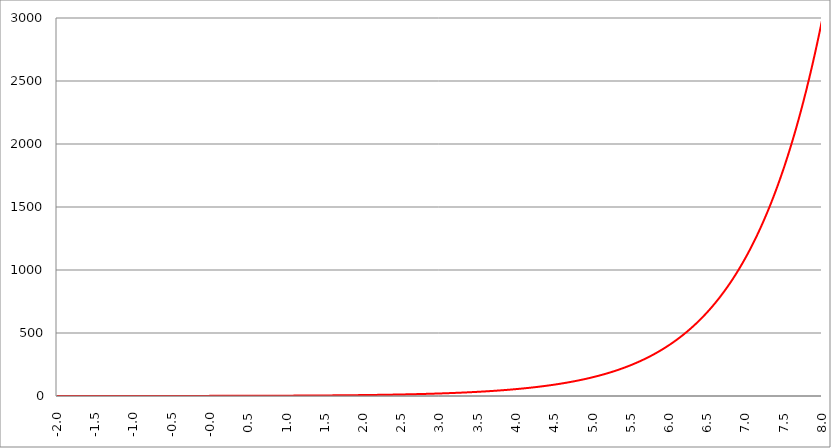
| Category | Series 1 | Series 0 | Series 2 |
|---|---|---|---|
| -2.0 | 0.135 |  |  |
| -1.995 | 0.136 |  |  |
| -1.99 | 0.137 |  |  |
| -1.985 | 0.137 |  |  |
| -1.98 | 0.138 |  |  |
| -1.975000000000001 | 0.139 |  |  |
| -1.970000000000001 | 0.139 |  |  |
| -1.965000000000001 | 0.14 |  |  |
| -1.960000000000001 | 0.141 |  |  |
| -1.955000000000001 | 0.142 |  |  |
| -1.950000000000001 | 0.142 |  |  |
| -1.945000000000001 | 0.143 |  |  |
| -1.940000000000001 | 0.144 |  |  |
| -1.935000000000001 | 0.144 |  |  |
| -1.930000000000001 | 0.145 |  |  |
| -1.925000000000002 | 0.146 |  |  |
| -1.920000000000002 | 0.147 |  |  |
| -1.915000000000002 | 0.147 |  |  |
| -1.910000000000002 | 0.148 |  |  |
| -1.905000000000002 | 0.149 |  |  |
| -1.900000000000002 | 0.15 |  |  |
| -1.895000000000002 | 0.15 |  |  |
| -1.890000000000002 | 0.151 |  |  |
| -1.885000000000002 | 0.152 |  |  |
| -1.880000000000002 | 0.153 |  |  |
| -1.875000000000003 | 0.153 |  |  |
| -1.870000000000003 | 0.154 |  |  |
| -1.865000000000003 | 0.155 |  |  |
| -1.860000000000003 | 0.156 |  |  |
| -1.855000000000003 | 0.156 |  |  |
| -1.850000000000003 | 0.157 |  |  |
| -1.845000000000003 | 0.158 |  |  |
| -1.840000000000003 | 0.159 |  |  |
| -1.835000000000003 | 0.16 |  |  |
| -1.830000000000004 | 0.16 |  |  |
| -1.825000000000004 | 0.161 |  |  |
| -1.820000000000004 | 0.162 |  |  |
| -1.815000000000004 | 0.163 |  |  |
| -1.810000000000004 | 0.164 |  |  |
| -1.805000000000004 | 0.164 |  |  |
| -1.800000000000004 | 0.165 |  |  |
| -1.795000000000004 | 0.166 |  |  |
| -1.790000000000004 | 0.167 |  |  |
| -1.785000000000004 | 0.168 |  |  |
| -1.780000000000005 | 0.169 |  |  |
| -1.775000000000005 | 0.169 |  |  |
| -1.770000000000005 | 0.17 |  |  |
| -1.765000000000005 | 0.171 |  |  |
| -1.760000000000005 | 0.172 |  |  |
| -1.755000000000005 | 0.173 |  |  |
| -1.750000000000005 | 0.174 |  |  |
| -1.745000000000005 | 0.175 |  |  |
| -1.740000000000005 | 0.176 |  |  |
| -1.735000000000006 | 0.176 |  |  |
| -1.730000000000006 | 0.177 |  |  |
| -1.725000000000006 | 0.178 |  |  |
| -1.720000000000006 | 0.179 |  |  |
| -1.715000000000006 | 0.18 |  |  |
| -1.710000000000006 | 0.181 |  |  |
| -1.705000000000006 | 0.182 |  |  |
| -1.700000000000006 | 0.183 |  |  |
| -1.695000000000006 | 0.184 |  |  |
| -1.690000000000006 | 0.185 |  |  |
| -1.685000000000007 | 0.185 |  |  |
| -1.680000000000007 | 0.186 |  |  |
| -1.675000000000007 | 0.187 |  |  |
| -1.670000000000007 | 0.188 |  |  |
| -1.665000000000007 | 0.189 |  |  |
| -1.660000000000007 | 0.19 |  |  |
| -1.655000000000007 | 0.191 |  |  |
| -1.650000000000007 | 0.192 |  |  |
| -1.645000000000007 | 0.193 |  |  |
| -1.640000000000008 | 0.194 |  |  |
| -1.635000000000008 | 0.195 |  |  |
| -1.630000000000008 | 0.196 |  |  |
| -1.625000000000008 | 0.197 |  |  |
| -1.620000000000008 | 0.198 |  |  |
| -1.615000000000008 | 0.199 |  |  |
| -1.610000000000008 | 0.2 |  |  |
| -1.605000000000008 | 0.201 |  |  |
| -1.600000000000008 | 0.202 |  |  |
| -1.595000000000009 | 0.203 |  |  |
| -1.590000000000009 | 0.204 |  |  |
| -1.585000000000009 | 0.205 |  |  |
| -1.580000000000009 | 0.206 |  |  |
| -1.57500000000001 | 0.207 |  |  |
| -1.57000000000001 | 0.208 |  |  |
| -1.565000000000009 | 0.209 |  |  |
| -1.560000000000009 | 0.21 |  |  |
| -1.555000000000009 | 0.211 |  |  |
| -1.55000000000001 | 0.212 |  |  |
| -1.54500000000001 | 0.213 |  |  |
| -1.54000000000001 | 0.214 |  |  |
| -1.53500000000001 | 0.215 |  |  |
| -1.53000000000001 | 0.217 |  |  |
| -1.52500000000001 | 0.218 |  |  |
| -1.52000000000001 | 0.219 |  |  |
| -1.51500000000001 | 0.22 |  |  |
| -1.51000000000001 | 0.221 |  |  |
| -1.505000000000011 | 0.222 |  |  |
| -1.500000000000011 | 0.223 |  |  |
| -1.495000000000011 | 0.224 |  |  |
| -1.490000000000011 | 0.225 |  |  |
| -1.485000000000011 | 0.227 |  |  |
| -1.480000000000011 | 0.228 |  |  |
| -1.475000000000011 | 0.229 |  |  |
| -1.470000000000011 | 0.23 |  |  |
| -1.465000000000011 | 0.231 |  |  |
| -1.460000000000011 | 0.232 |  |  |
| -1.455000000000012 | 0.233 |  |  |
| -1.450000000000012 | 0.235 |  |  |
| -1.445000000000012 | 0.236 |  |  |
| -1.440000000000012 | 0.237 |  |  |
| -1.435000000000012 | 0.238 |  |  |
| -1.430000000000012 | 0.239 |  |  |
| -1.425000000000012 | 0.241 |  |  |
| -1.420000000000012 | 0.242 |  |  |
| -1.415000000000012 | 0.243 |  |  |
| -1.410000000000013 | 0.244 |  |  |
| -1.405000000000013 | 0.245 |  |  |
| -1.400000000000013 | 0.247 |  |  |
| -1.395000000000013 | 0.248 |  |  |
| -1.390000000000013 | 0.249 |  |  |
| -1.385000000000013 | 0.25 |  |  |
| -1.380000000000013 | 0.252 |  |  |
| -1.375000000000013 | 0.253 |  |  |
| -1.370000000000013 | 0.254 |  |  |
| -1.365000000000013 | 0.255 |  |  |
| -1.360000000000014 | 0.257 |  |  |
| -1.355000000000014 | 0.258 |  |  |
| -1.350000000000014 | 0.259 |  |  |
| -1.345000000000014 | 0.261 |  |  |
| -1.340000000000014 | 0.262 |  |  |
| -1.335000000000014 | 0.263 |  |  |
| -1.330000000000014 | 0.264 |  |  |
| -1.325000000000014 | 0.266 |  |  |
| -1.320000000000014 | 0.267 |  |  |
| -1.315000000000015 | 0.268 |  |  |
| -1.310000000000015 | 0.27 |  |  |
| -1.305000000000015 | 0.271 |  |  |
| -1.300000000000015 | 0.273 |  |  |
| -1.295000000000015 | 0.274 |  |  |
| -1.290000000000015 | 0.275 |  |  |
| -1.285000000000015 | 0.277 |  |  |
| -1.280000000000015 | 0.278 |  |  |
| -1.275000000000015 | 0.279 |  |  |
| -1.270000000000016 | 0.281 |  |  |
| -1.265000000000016 | 0.282 |  |  |
| -1.260000000000016 | 0.284 |  |  |
| -1.255000000000016 | 0.285 |  |  |
| -1.250000000000016 | 0.287 |  |  |
| -1.245000000000016 | 0.288 |  |  |
| -1.240000000000016 | 0.289 |  |  |
| -1.235000000000016 | 0.291 |  |  |
| -1.230000000000016 | 0.292 |  |  |
| -1.225000000000017 | 0.294 |  |  |
| -1.220000000000017 | 0.295 |  |  |
| -1.215000000000017 | 0.297 |  |  |
| -1.210000000000017 | 0.298 |  |  |
| -1.205000000000017 | 0.3 |  |  |
| -1.200000000000017 | 0.301 |  |  |
| -1.195000000000017 | 0.303 |  |  |
| -1.190000000000017 | 0.304 |  |  |
| -1.185000000000017 | 0.306 |  |  |
| -1.180000000000017 | 0.307 |  |  |
| -1.175000000000018 | 0.309 |  |  |
| -1.170000000000018 | 0.31 |  |  |
| -1.165000000000018 | 0.312 |  |  |
| -1.160000000000018 | 0.313 |  |  |
| -1.155000000000018 | 0.315 |  |  |
| -1.150000000000018 | 0.317 |  |  |
| -1.145000000000018 | 0.318 |  |  |
| -1.140000000000018 | 0.32 |  |  |
| -1.135000000000018 | 0.321 |  |  |
| -1.130000000000019 | 0.323 |  |  |
| -1.125000000000019 | 0.325 |  |  |
| -1.120000000000019 | 0.326 |  |  |
| -1.115000000000019 | 0.328 |  |  |
| -1.110000000000019 | 0.33 |  |  |
| -1.10500000000002 | 0.331 |  |  |
| -1.10000000000002 | 0.333 |  |  |
| -1.095000000000019 | 0.335 |  |  |
| -1.090000000000019 | 0.336 |  |  |
| -1.085000000000019 | 0.338 |  |  |
| -1.08000000000002 | 0.34 |  |  |
| -1.07500000000002 | 0.341 |  |  |
| -1.07000000000002 | 0.343 |  |  |
| -1.06500000000002 | 0.345 |  |  |
| -1.06000000000002 | 0.346 |  |  |
| -1.05500000000002 | 0.348 |  |  |
| -1.05000000000002 | 0.35 |  |  |
| -1.04500000000002 | 0.352 |  |  |
| -1.04000000000002 | 0.353 |  |  |
| -1.035000000000021 | 0.355 |  |  |
| -1.030000000000021 | 0.357 |  |  |
| -1.025000000000021 | 0.359 |  |  |
| -1.020000000000021 | 0.361 |  |  |
| -1.015000000000021 | 0.362 |  |  |
| -1.010000000000021 | 0.364 |  |  |
| -1.005000000000021 | 0.366 |  |  |
| -1.000000000000021 | 0.368 |  |  |
| -0.995000000000021 | 0.37 |  |  |
| -0.990000000000021 | 0.372 |  |  |
| -0.985000000000021 | 0.373 |  |  |
| -0.980000000000021 | 0.375 |  |  |
| -0.975000000000021 | 0.377 |  |  |
| -0.970000000000021 | 0.379 |  |  |
| -0.965000000000021 | 0.381 |  |  |
| -0.960000000000021 | 0.383 |  |  |
| -0.955000000000021 | 0.385 |  |  |
| -0.950000000000021 | 0.387 |  |  |
| -0.945000000000021 | 0.389 |  |  |
| -0.940000000000021 | 0.391 |  |  |
| -0.935000000000021 | 0.393 |  |  |
| -0.930000000000021 | 0.395 |  |  |
| -0.925000000000021 | 0.397 |  |  |
| -0.920000000000021 | 0.399 |  |  |
| -0.915000000000021 | 0.401 |  |  |
| -0.910000000000021 | 0.403 |  |  |
| -0.905000000000021 | 0.405 |  |  |
| -0.900000000000021 | 0.407 |  |  |
| -0.895000000000021 | 0.409 |  |  |
| -0.890000000000021 | 0.411 |  |  |
| -0.885000000000021 | 0.413 |  |  |
| -0.880000000000021 | 0.415 |  |  |
| -0.875000000000021 | 0.417 |  |  |
| -0.870000000000021 | 0.419 |  |  |
| -0.865000000000021 | 0.421 |  |  |
| -0.860000000000021 | 0.423 |  |  |
| -0.855000000000021 | 0.425 |  |  |
| -0.850000000000021 | 0.427 |  |  |
| -0.845000000000021 | 0.43 |  |  |
| -0.840000000000021 | 0.432 |  |  |
| -0.835000000000021 | 0.434 |  |  |
| -0.830000000000021 | 0.436 |  |  |
| -0.825000000000021 | 0.438 |  |  |
| -0.820000000000021 | 0.44 |  |  |
| -0.815000000000021 | 0.443 |  |  |
| -0.810000000000021 | 0.445 |  |  |
| -0.805000000000021 | 0.447 |  |  |
| -0.800000000000021 | 0.449 |  |  |
| -0.795000000000021 | 0.452 |  |  |
| -0.790000000000021 | 0.454 |  |  |
| -0.785000000000021 | 0.456 |  |  |
| -0.780000000000021 | 0.458 |  |  |
| -0.775000000000021 | 0.461 |  |  |
| -0.770000000000021 | 0.463 |  |  |
| -0.765000000000021 | 0.465 |  |  |
| -0.760000000000021 | 0.468 |  |  |
| -0.755000000000021 | 0.47 |  |  |
| -0.750000000000021 | 0.472 |  |  |
| -0.745000000000021 | 0.475 |  |  |
| -0.740000000000021 | 0.477 |  |  |
| -0.735000000000021 | 0.48 |  |  |
| -0.730000000000021 | 0.482 |  |  |
| -0.725000000000021 | 0.484 |  |  |
| -0.720000000000021 | 0.487 |  |  |
| -0.715000000000021 | 0.489 |  |  |
| -0.710000000000021 | 0.492 |  |  |
| -0.705000000000021 | 0.494 |  |  |
| -0.700000000000021 | 0.497 |  |  |
| -0.695000000000021 | 0.499 |  |  |
| -0.690000000000021 | 0.502 |  |  |
| -0.685000000000021 | 0.504 |  |  |
| -0.680000000000021 | 0.507 |  |  |
| -0.675000000000021 | 0.509 |  |  |
| -0.670000000000021 | 0.512 |  |  |
| -0.665000000000021 | 0.514 |  |  |
| -0.660000000000021 | 0.517 |  |  |
| -0.655000000000021 | 0.519 |  |  |
| -0.650000000000021 | 0.522 |  |  |
| -0.645000000000021 | 0.525 |  |  |
| -0.640000000000021 | 0.527 |  |  |
| -0.635000000000021 | 0.53 |  |  |
| -0.630000000000021 | 0.533 |  |  |
| -0.625000000000021 | 0.535 |  |  |
| -0.620000000000021 | 0.538 |  |  |
| -0.615000000000021 | 0.541 |  |  |
| -0.610000000000021 | 0.543 |  |  |
| -0.605000000000021 | 0.546 |  |  |
| -0.600000000000021 | 0.549 |  |  |
| -0.595000000000021 | 0.552 |  |  |
| -0.590000000000021 | 0.554 |  |  |
| -0.585000000000021 | 0.557 |  |  |
| -0.580000000000021 | 0.56 |  |  |
| -0.575000000000021 | 0.563 |  |  |
| -0.570000000000021 | 0.566 |  |  |
| -0.565000000000021 | 0.568 |  |  |
| -0.560000000000021 | 0.571 |  |  |
| -0.555000000000021 | 0.574 |  |  |
| -0.550000000000021 | 0.577 |  |  |
| -0.545000000000021 | 0.58 |  |  |
| -0.540000000000021 | 0.583 |  |  |
| -0.535000000000021 | 0.586 |  |  |
| -0.530000000000021 | 0.589 |  |  |
| -0.525000000000021 | 0.592 |  |  |
| -0.520000000000021 | 0.595 |  |  |
| -0.515000000000021 | 0.598 |  |  |
| -0.510000000000021 | 0.6 |  |  |
| -0.505000000000021 | 0.604 |  |  |
| -0.500000000000021 | 0.607 |  |  |
| -0.495000000000021 | 0.61 |  |  |
| -0.490000000000021 | 0.613 |  |  |
| -0.485000000000021 | 0.616 |  |  |
| -0.480000000000021 | 0.619 |  |  |
| -0.475000000000021 | 0.622 |  |  |
| -0.470000000000021 | 0.625 |  |  |
| -0.465000000000021 | 0.628 |  |  |
| -0.460000000000021 | 0.631 |  |  |
| -0.455000000000021 | 0.634 |  |  |
| -0.450000000000021 | 0.638 |  |  |
| -0.445000000000021 | 0.641 |  |  |
| -0.440000000000021 | 0.644 |  |  |
| -0.435000000000021 | 0.647 |  |  |
| -0.430000000000021 | 0.651 |  |  |
| -0.425000000000021 | 0.654 |  |  |
| -0.420000000000021 | 0.657 |  |  |
| -0.415000000000021 | 0.66 |  |  |
| -0.410000000000021 | 0.664 |  |  |
| -0.405000000000021 | 0.667 |  |  |
| -0.400000000000021 | 0.67 |  |  |
| -0.395000000000021 | 0.674 |  |  |
| -0.390000000000021 | 0.677 |  |  |
| -0.385000000000021 | 0.68 |  |  |
| -0.380000000000021 | 0.684 |  |  |
| -0.375000000000021 | 0.687 |  |  |
| -0.370000000000021 | 0.691 |  |  |
| -0.365000000000021 | 0.694 |  |  |
| -0.360000000000021 | 0.698 |  |  |
| -0.355000000000021 | 0.701 |  |  |
| -0.350000000000021 | 0.705 |  |  |
| -0.345000000000021 | 0.708 |  |  |
| -0.340000000000021 | 0.712 |  |  |
| -0.335000000000021 | 0.715 |  |  |
| -0.330000000000021 | 0.719 |  |  |
| -0.325000000000021 | 0.723 |  |  |
| -0.320000000000021 | 0.726 |  |  |
| -0.315000000000021 | 0.73 |  |  |
| -0.310000000000021 | 0.733 |  |  |
| -0.305000000000021 | 0.737 |  |  |
| -0.300000000000021 | 0.741 |  |  |
| -0.295000000000021 | 0.745 |  |  |
| -0.290000000000021 | 0.748 |  |  |
| -0.285000000000021 | 0.752 |  |  |
| -0.280000000000021 | 0.756 |  |  |
| -0.275000000000021 | 0.76 |  |  |
| -0.270000000000021 | 0.763 |  |  |
| -0.265000000000021 | 0.767 |  |  |
| -0.260000000000021 | 0.771 |  |  |
| -0.255000000000021 | 0.775 |  |  |
| -0.250000000000021 | 0.779 |  |  |
| -0.245000000000021 | 0.783 |  |  |
| -0.240000000000021 | 0.787 |  |  |
| -0.235000000000021 | 0.791 |  |  |
| -0.230000000000021 | 0.795 |  |  |
| -0.225000000000021 | 0.799 |  |  |
| -0.220000000000021 | 0.803 |  |  |
| -0.215000000000021 | 0.807 |  |  |
| -0.210000000000021 | 0.811 |  |  |
| -0.205000000000021 | 0.815 |  |  |
| -0.200000000000021 | 0.819 |  |  |
| -0.195000000000021 | 0.823 |  |  |
| -0.190000000000021 | 0.827 |  |  |
| -0.185000000000021 | 0.831 |  |  |
| -0.180000000000021 | 0.835 |  |  |
| -0.175000000000021 | 0.839 |  |  |
| -0.170000000000021 | 0.844 |  |  |
| -0.165000000000021 | 0.848 |  |  |
| -0.160000000000021 | 0.852 |  |  |
| -0.155000000000021 | 0.856 |  |  |
| -0.150000000000021 | 0.861 |  |  |
| -0.145000000000021 | 0.865 |  |  |
| -0.140000000000021 | 0.869 |  |  |
| -0.135000000000021 | 0.874 |  |  |
| -0.130000000000021 | 0.878 |  |  |
| -0.125000000000021 | 0.882 |  |  |
| -0.120000000000021 | 0.887 |  |  |
| -0.115000000000021 | 0.891 |  |  |
| -0.110000000000021 | 0.896 |  |  |
| -0.105000000000021 | 0.9 |  |  |
| -0.100000000000021 | 0.905 |  |  |
| -0.0950000000000205 | 0.909 |  |  |
| -0.0900000000000205 | 0.914 |  |  |
| -0.0850000000000205 | 0.919 |  |  |
| -0.0800000000000205 | 0.923 |  |  |
| -0.0750000000000205 | 0.928 |  |  |
| -0.0700000000000205 | 0.932 |  |  |
| -0.0650000000000205 | 0.937 |  |  |
| -0.0600000000000205 | 0.942 |  |  |
| -0.0550000000000205 | 0.946 |  |  |
| -0.0500000000000205 | 0.951 |  |  |
| -0.0450000000000205 | 0.956 |  |  |
| -0.0400000000000205 | 0.961 |  |  |
| -0.0350000000000205 | 0.966 |  |  |
| -0.0300000000000205 | 0.97 |  |  |
| -0.0250000000000205 | 0.975 |  |  |
| -0.0200000000000205 | 0.98 |  |  |
| -0.0150000000000205 | 0.985 |  |  |
| -0.0100000000000205 | 0.99 |  |  |
| -0.00500000000002049 | 0.995 |  |  |
| -2.0495757868666e-14 | 1 |  |  |
| 0.0049999999999795 | 1.005 |  |  |
| 0.0099999999999795 | 1.01 |  |  |
| 0.0149999999999795 | 1.015 |  |  |
| 0.0199999999999795 | 1.02 |  |  |
| 0.0249999999999795 | 1.025 |  |  |
| 0.0299999999999795 | 1.03 |  |  |
| 0.0349999999999795 | 1.036 |  |  |
| 0.0399999999999795 | 1.041 |  |  |
| 0.0449999999999795 | 1.046 |  |  |
| 0.0499999999999795 | 1.051 |  |  |
| 0.0549999999999795 | 1.057 |  |  |
| 0.0599999999999795 | 1.062 |  |  |
| 0.0649999999999795 | 1.067 |  |  |
| 0.0699999999999795 | 1.073 |  |  |
| 0.0749999999999795 | 1.078 |  |  |
| 0.0799999999999795 | 1.083 |  |  |
| 0.0849999999999795 | 1.089 |  |  |
| 0.0899999999999795 | 1.094 |  |  |
| 0.0949999999999795 | 1.1 |  |  |
| 0.0999999999999795 | 1.105 |  |  |
| 0.10499999999998 | 1.111 |  |  |
| 0.10999999999998 | 1.116 |  |  |
| 0.11499999999998 | 1.122 |  |  |
| 0.11999999999998 | 1.127 |  |  |
| 0.12499999999998 | 1.133 |  |  |
| 0.12999999999998 | 1.139 |  |  |
| 0.13499999999998 | 1.145 |  |  |
| 0.13999999999998 | 1.15 |  |  |
| 0.14499999999998 | 1.156 |  |  |
| 0.14999999999998 | 1.162 |  |  |
| 0.15499999999998 | 1.168 |  |  |
| 0.15999999999998 | 1.174 |  |  |
| 0.16499999999998 | 1.179 |  |  |
| 0.16999999999998 | 1.185 |  |  |
| 0.17499999999998 | 1.191 |  |  |
| 0.17999999999998 | 1.197 |  |  |
| 0.18499999999998 | 1.203 |  |  |
| 0.18999999999998 | 1.209 |  |  |
| 0.19499999999998 | 1.215 |  |  |
| 0.19999999999998 | 1.221 |  |  |
| 0.20499999999998 | 1.228 |  |  |
| 0.20999999999998 | 1.234 |  |  |
| 0.21499999999998 | 1.24 |  |  |
| 0.21999999999998 | 1.246 |  |  |
| 0.22499999999998 | 1.252 |  |  |
| 0.22999999999998 | 1.259 |  |  |
| 0.23499999999998 | 1.265 |  |  |
| 0.23999999999998 | 1.271 |  |  |
| 0.24499999999998 | 1.278 |  |  |
| 0.24999999999998 | 1.284 |  |  |
| 0.25499999999998 | 1.29 |  |  |
| 0.25999999999998 | 1.297 |  |  |
| 0.26499999999998 | 1.303 |  |  |
| 0.26999999999998 | 1.31 |  |  |
| 0.27499999999998 | 1.317 |  |  |
| 0.27999999999998 | 1.323 |  |  |
| 0.28499999999998 | 1.33 |  |  |
| 0.28999999999998 | 1.336 |  |  |
| 0.29499999999998 | 1.343 |  |  |
| 0.29999999999998 | 1.35 |  |  |
| 0.30499999999998 | 1.357 |  |  |
| 0.30999999999998 | 1.363 |  |  |
| 0.31499999999998 | 1.37 |  |  |
| 0.31999999999998 | 1.377 |  |  |
| 0.32499999999998 | 1.384 |  |  |
| 0.32999999999998 | 1.391 |  |  |
| 0.33499999999998 | 1.398 |  |  |
| 0.33999999999998 | 1.405 |  |  |
| 0.34499999999998 | 1.412 |  |  |
| 0.34999999999998 | 1.419 |  |  |
| 0.35499999999998 | 1.426 |  |  |
| 0.35999999999998 | 1.433 |  |  |
| 0.36499999999998 | 1.441 |  |  |
| 0.36999999999998 | 1.448 |  |  |
| 0.37499999999998 | 1.455 |  |  |
| 0.37999999999998 | 1.462 |  |  |
| 0.38499999999998 | 1.47 |  |  |
| 0.38999999999998 | 1.477 |  |  |
| 0.39499999999998 | 1.484 |  |  |
| 0.39999999999998 | 1.492 |  |  |
| 0.40499999999998 | 1.499 |  |  |
| 0.40999999999998 | 1.507 |  |  |
| 0.41499999999998 | 1.514 |  |  |
| 0.41999999999998 | 1.522 |  |  |
| 0.42499999999998 | 1.53 |  |  |
| 0.42999999999998 | 1.537 |  |  |
| 0.43499999999998 | 1.545 |  |  |
| 0.43999999999998 | 1.553 |  |  |
| 0.44499999999998 | 1.56 |  |  |
| 0.44999999999998 | 1.568 |  |  |
| 0.45499999999998 | 1.576 |  |  |
| 0.45999999999998 | 1.584 |  |  |
| 0.46499999999998 | 1.592 |  |  |
| 0.46999999999998 | 1.6 |  |  |
| 0.47499999999998 | 1.608 |  |  |
| 0.47999999999998 | 1.616 |  |  |
| 0.48499999999998 | 1.624 |  |  |
| 0.48999999999998 | 1.632 |  |  |
| 0.49499999999998 | 1.64 |  |  |
| 0.49999999999998 | 1.649 |  |  |
| 0.50499999999998 | 1.657 |  |  |
| 0.50999999999998 | 1.665 |  |  |
| 0.51499999999998 | 1.674 |  |  |
| 0.51999999999998 | 1.682 |  |  |
| 0.52499999999998 | 1.69 |  |  |
| 0.52999999999998 | 1.699 |  |  |
| 0.53499999999998 | 1.707 |  |  |
| 0.53999999999998 | 1.716 |  |  |
| 0.54499999999998 | 1.725 |  |  |
| 0.54999999999998 | 1.733 |  |  |
| 0.55499999999998 | 1.742 |  |  |
| 0.55999999999998 | 1.751 |  |  |
| 0.56499999999998 | 1.759 |  |  |
| 0.56999999999998 | 1.768 |  |  |
| 0.57499999999998 | 1.777 |  |  |
| 0.57999999999998 | 1.786 |  |  |
| 0.58499999999998 | 1.795 |  |  |
| 0.58999999999998 | 1.804 |  |  |
| 0.59499999999998 | 1.813 |  |  |
| 0.59999999999998 | 1.822 |  |  |
| 0.60499999999998 | 1.831 |  |  |
| 0.60999999999998 | 1.84 |  |  |
| 0.61499999999998 | 1.85 |  |  |
| 0.61999999999998 | 1.859 |  |  |
| 0.62499999999998 | 1.868 |  |  |
| 0.62999999999998 | 1.878 |  |  |
| 0.63499999999998 | 1.887 |  |  |
| 0.63999999999998 | 1.896 |  |  |
| 0.64499999999998 | 1.906 |  |  |
| 0.64999999999998 | 1.916 |  |  |
| 0.65499999999998 | 1.925 |  |  |
| 0.65999999999998 | 1.935 |  |  |
| 0.66499999999998 | 1.944 |  |  |
| 0.66999999999998 | 1.954 |  |  |
| 0.67499999999998 | 1.964 |  |  |
| 0.67999999999998 | 1.974 |  |  |
| 0.68499999999998 | 1.984 |  |  |
| 0.68999999999998 | 1.994 |  |  |
| 0.69499999999998 | 2.004 |  |  |
| 0.69999999999998 | 2.014 |  |  |
| 0.70499999999998 | 2.024 |  |  |
| 0.70999999999998 | 2.034 |  |  |
| 0.71499999999998 | 2.044 |  |  |
| 0.71999999999998 | 2.054 |  |  |
| 0.72499999999998 | 2.065 |  |  |
| 0.72999999999998 | 2.075 |  |  |
| 0.73499999999998 | 2.085 |  |  |
| 0.73999999999998 | 2.096 |  |  |
| 0.74499999999998 | 2.106 |  |  |
| 0.74999999999998 | 2.117 |  |  |
| 0.75499999999998 | 2.128 |  |  |
| 0.75999999999998 | 2.138 |  |  |
| 0.76499999999998 | 2.149 |  |  |
| 0.76999999999998 | 2.16 |  |  |
| 0.77499999999998 | 2.171 |  |  |
| 0.77999999999998 | 2.181 |  |  |
| 0.78499999999998 | 2.192 |  |  |
| 0.78999999999998 | 2.203 |  |  |
| 0.79499999999998 | 2.214 |  |  |
| 0.79999999999998 | 2.226 |  |  |
| 0.80499999999998 | 2.237 |  |  |
| 0.80999999999998 | 2.248 |  |  |
| 0.81499999999998 | 2.259 |  |  |
| 0.81999999999998 | 2.27 |  |  |
| 0.82499999999998 | 2.282 |  |  |
| 0.82999999999998 | 2.293 |  |  |
| 0.83499999999998 | 2.305 |  |  |
| 0.83999999999998 | 2.316 |  |  |
| 0.84499999999998 | 2.328 |  |  |
| 0.84999999999998 | 2.34 |  |  |
| 0.85499999999998 | 2.351 |  |  |
| 0.85999999999998 | 2.363 |  |  |
| 0.86499999999998 | 2.375 |  |  |
| 0.86999999999998 | 2.387 |  |  |
| 0.87499999999998 | 2.399 |  |  |
| 0.87999999999998 | 2.411 |  |  |
| 0.88499999999998 | 2.423 |  |  |
| 0.88999999999998 | 2.435 |  |  |
| 0.89499999999998 | 2.447 |  |  |
| 0.89999999999998 | 2.46 |  |  |
| 0.90499999999998 | 2.472 |  |  |
| 0.90999999999998 | 2.484 |  |  |
| 0.91499999999998 | 2.497 |  |  |
| 0.91999999999998 | 2.509 |  |  |
| 0.92499999999998 | 2.522 |  |  |
| 0.92999999999998 | 2.535 |  |  |
| 0.93499999999998 | 2.547 |  |  |
| 0.93999999999998 | 2.56 |  |  |
| 0.94499999999998 | 2.573 |  |  |
| 0.94999999999998 | 2.586 |  |  |
| 0.95499999999998 | 2.599 |  |  |
| 0.95999999999998 | 2.612 |  |  |
| 0.96499999999998 | 2.625 |  |  |
| 0.96999999999998 | 2.638 |  |  |
| 0.97499999999998 | 2.651 |  |  |
| 0.97999999999998 | 2.664 |  |  |
| 0.98499999999998 | 2.678 |  |  |
| 0.98999999999998 | 2.691 |  |  |
| 0.99499999999998 | 2.705 |  |  |
| 0.99999999999998 | 2.718 |  |  |
| 1.00499999999998 | 2.732 |  |  |
| 1.00999999999998 | 2.746 |  |  |
| 1.01499999999998 | 2.759 |  |  |
| 1.01999999999998 | 2.773 |  |  |
| 1.02499999999998 | 2.787 |  |  |
| 1.02999999999998 | 2.801 |  |  |
| 1.034999999999979 | 2.815 |  |  |
| 1.039999999999979 | 2.829 |  |  |
| 1.044999999999979 | 2.843 |  |  |
| 1.049999999999979 | 2.858 |  |  |
| 1.054999999999979 | 2.872 |  |  |
| 1.059999999999979 | 2.886 |  |  |
| 1.064999999999979 | 2.901 |  |  |
| 1.069999999999979 | 2.915 |  |  |
| 1.074999999999979 | 2.93 |  |  |
| 1.079999999999979 | 2.945 |  |  |
| 1.084999999999978 | 2.959 |  |  |
| 1.089999999999978 | 2.974 |  |  |
| 1.094999999999978 | 2.989 |  |  |
| 1.099999999999978 | 3.004 |  |  |
| 1.104999999999978 | 3.019 |  |  |
| 1.109999999999978 | 3.034 |  |  |
| 1.114999999999978 | 3.05 |  |  |
| 1.119999999999978 | 3.065 |  |  |
| 1.124999999999978 | 3.08 |  |  |
| 1.129999999999977 | 3.096 |  |  |
| 1.134999999999977 | 3.111 |  |  |
| 1.139999999999977 | 3.127 |  |  |
| 1.144999999999977 | 3.142 |  |  |
| 1.149999999999977 | 3.158 |  |  |
| 1.154999999999977 | 3.174 |  |  |
| 1.159999999999977 | 3.19 |  |  |
| 1.164999999999977 | 3.206 |  |  |
| 1.169999999999977 | 3.222 |  |  |
| 1.174999999999976 | 3.238 |  |  |
| 1.179999999999976 | 3.254 |  |  |
| 1.184999999999976 | 3.271 |  |  |
| 1.189999999999976 | 3.287 |  |  |
| 1.194999999999976 | 3.304 |  |  |
| 1.199999999999976 | 3.32 |  |  |
| 1.204999999999976 | 3.337 |  |  |
| 1.209999999999976 | 3.353 |  |  |
| 1.214999999999976 | 3.37 |  |  |
| 1.219999999999976 | 3.387 |  |  |
| 1.224999999999975 | 3.404 |  |  |
| 1.229999999999975 | 3.421 |  |  |
| 1.234999999999975 | 3.438 |  |  |
| 1.239999999999975 | 3.456 |  |  |
| 1.244999999999975 | 3.473 |  |  |
| 1.249999999999975 | 3.49 |  |  |
| 1.254999999999975 | 3.508 |  |  |
| 1.259999999999975 | 3.525 |  |  |
| 1.264999999999975 | 3.543 |  |  |
| 1.269999999999974 | 3.561 |  |  |
| 1.274999999999974 | 3.579 |  |  |
| 1.279999999999974 | 3.597 |  |  |
| 1.284999999999974 | 3.615 |  |  |
| 1.289999999999974 | 3.633 |  |  |
| 1.294999999999974 | 3.651 |  |  |
| 1.299999999999974 | 3.669 |  |  |
| 1.304999999999974 | 3.688 |  |  |
| 1.309999999999974 | 3.706 |  |  |
| 1.314999999999973 | 3.725 |  |  |
| 1.319999999999973 | 3.743 |  |  |
| 1.324999999999973 | 3.762 |  |  |
| 1.329999999999973 | 3.781 |  |  |
| 1.334999999999973 | 3.8 |  |  |
| 1.339999999999973 | 3.819 |  |  |
| 1.344999999999973 | 3.838 |  |  |
| 1.349999999999973 | 3.857 |  |  |
| 1.354999999999973 | 3.877 |  |  |
| 1.359999999999973 | 3.896 |  |  |
| 1.364999999999972 | 3.916 |  |  |
| 1.369999999999972 | 3.935 |  |  |
| 1.374999999999972 | 3.955 |  |  |
| 1.379999999999972 | 3.975 |  |  |
| 1.384999999999972 | 3.995 |  |  |
| 1.389999999999972 | 4.015 |  |  |
| 1.394999999999972 | 4.035 |  |  |
| 1.399999999999972 | 4.055 |  |  |
| 1.404999999999972 | 4.076 |  |  |
| 1.409999999999971 | 4.096 |  |  |
| 1.414999999999971 | 4.116 |  |  |
| 1.419999999999971 | 4.137 |  |  |
| 1.424999999999971 | 4.158 |  |  |
| 1.429999999999971 | 4.179 |  |  |
| 1.434999999999971 | 4.2 |  |  |
| 1.439999999999971 | 4.221 |  |  |
| 1.444999999999971 | 4.242 |  |  |
| 1.449999999999971 | 4.263 |  |  |
| 1.454999999999971 | 4.284 |  |  |
| 1.45999999999997 | 4.306 |  |  |
| 1.46499999999997 | 4.328 |  |  |
| 1.46999999999997 | 4.349 |  |  |
| 1.47499999999997 | 4.371 |  |  |
| 1.47999999999997 | 4.393 |  |  |
| 1.48499999999997 | 4.415 |  |  |
| 1.48999999999997 | 4.437 |  |  |
| 1.49499999999997 | 4.459 |  |  |
| 1.49999999999997 | 4.482 |  |  |
| 1.504999999999969 | 4.504 |  |  |
| 1.509999999999969 | 4.527 |  |  |
| 1.514999999999969 | 4.549 |  |  |
| 1.519999999999969 | 4.572 |  |  |
| 1.524999999999969 | 4.595 |  |  |
| 1.529999999999969 | 4.618 |  |  |
| 1.534999999999969 | 4.641 |  |  |
| 1.539999999999969 | 4.665 |  |  |
| 1.544999999999969 | 4.688 |  |  |
| 1.549999999999969 | 4.711 |  |  |
| 1.554999999999968 | 4.735 |  |  |
| 1.559999999999968 | 4.759 |  |  |
| 1.564999999999968 | 4.783 |  |  |
| 1.569999999999968 | 4.807 |  |  |
| 1.574999999999968 | 4.831 |  |  |
| 1.579999999999968 | 4.855 |  |  |
| 1.584999999999968 | 4.879 |  |  |
| 1.589999999999968 | 4.904 |  |  |
| 1.594999999999968 | 4.928 |  |  |
| 1.599999999999967 | 4.953 |  |  |
| 1.604999999999967 | 4.978 |  |  |
| 1.609999999999967 | 5.003 |  |  |
| 1.614999999999967 | 5.028 |  |  |
| 1.619999999999967 | 5.053 |  |  |
| 1.624999999999967 | 5.078 |  |  |
| 1.629999999999967 | 5.104 |  |  |
| 1.634999999999967 | 5.129 |  |  |
| 1.639999999999966 | 5.155 |  |  |
| 1.644999999999966 | 5.181 |  |  |
| 1.649999999999966 | 5.207 |  |  |
| 1.654999999999966 | 5.233 |  |  |
| 1.659999999999966 | 5.259 |  |  |
| 1.664999999999966 | 5.286 |  |  |
| 1.669999999999966 | 5.312 |  |  |
| 1.674999999999966 | 5.339 |  |  |
| 1.679999999999966 | 5.366 |  |  |
| 1.684999999999966 | 5.392 |  |  |
| 1.689999999999965 | 5.419 |  |  |
| 1.694999999999965 | 5.447 |  |  |
| 1.699999999999965 | 5.474 |  |  |
| 1.704999999999965 | 5.501 |  |  |
| 1.709999999999965 | 5.529 |  |  |
| 1.714999999999965 | 5.557 |  |  |
| 1.719999999999965 | 5.585 |  |  |
| 1.724999999999965 | 5.613 |  |  |
| 1.729999999999965 | 5.641 |  |  |
| 1.734999999999964 | 5.669 |  |  |
| 1.739999999999964 | 5.697 |  |  |
| 1.744999999999964 | 5.726 |  |  |
| 1.749999999999964 | 5.755 |  |  |
| 1.754999999999964 | 5.783 |  |  |
| 1.759999999999964 | 5.812 |  |  |
| 1.764999999999964 | 5.842 |  |  |
| 1.769999999999964 | 5.871 |  |  |
| 1.774999999999964 | 5.9 |  |  |
| 1.779999999999964 | 5.93 |  |  |
| 1.784999999999963 | 5.96 |  |  |
| 1.789999999999963 | 5.989 |  |  |
| 1.794999999999963 | 6.019 |  |  |
| 1.799999999999963 | 6.05 |  |  |
| 1.804999999999963 | 6.08 |  |  |
| 1.809999999999963 | 6.11 |  |  |
| 1.814999999999963 | 6.141 |  |  |
| 1.819999999999963 | 6.172 |  |  |
| 1.824999999999963 | 6.203 |  |  |
| 1.829999999999962 | 6.234 |  |  |
| 1.834999999999962 | 6.265 |  |  |
| 1.839999999999962 | 6.297 |  |  |
| 1.844999999999962 | 6.328 |  |  |
| 1.849999999999962 | 6.36 |  |  |
| 1.854999999999962 | 6.392 |  |  |
| 1.859999999999962 | 6.424 |  |  |
| 1.864999999999962 | 6.456 |  |  |
| 1.869999999999962 | 6.488 |  |  |
| 1.874999999999962 | 6.521 |  |  |
| 1.879999999999961 | 6.554 |  |  |
| 1.884999999999961 | 6.586 |  |  |
| 1.889999999999961 | 6.619 |  |  |
| 1.894999999999961 | 6.653 |  |  |
| 1.899999999999961 | 6.686 |  |  |
| 1.904999999999961 | 6.719 |  |  |
| 1.909999999999961 | 6.753 |  |  |
| 1.914999999999961 | 6.787 |  |  |
| 1.919999999999961 | 6.821 |  |  |
| 1.92499999999996 | 6.855 |  |  |
| 1.92999999999996 | 6.89 |  |  |
| 1.93499999999996 | 6.924 |  |  |
| 1.93999999999996 | 6.959 |  |  |
| 1.94499999999996 | 6.994 |  |  |
| 1.94999999999996 | 7.029 |  |  |
| 1.95499999999996 | 7.064 |  |  |
| 1.95999999999996 | 7.099 |  |  |
| 1.96499999999996 | 7.135 |  |  |
| 1.96999999999996 | 7.171 |  |  |
| 1.974999999999959 | 7.207 |  |  |
| 1.979999999999959 | 7.243 |  |  |
| 1.984999999999959 | 7.279 |  |  |
| 1.989999999999959 | 7.316 |  |  |
| 1.994999999999959 | 7.352 |  |  |
| 1.999999999999959 | 7.389 |  |  |
| 2.00499999999996 | 7.426 |  |  |
| 2.009999999999959 | 7.463 |  |  |
| 2.014999999999959 | 7.501 |  |  |
| 2.019999999999959 | 7.538 |  |  |
| 2.024999999999959 | 7.576 |  |  |
| 2.029999999999958 | 7.614 |  |  |
| 2.034999999999958 | 7.652 |  |  |
| 2.039999999999958 | 7.691 |  |  |
| 2.044999999999958 | 7.729 |  |  |
| 2.049999999999958 | 7.768 |  |  |
| 2.054999999999958 | 7.807 |  |  |
| 2.059999999999958 | 7.846 |  |  |
| 2.064999999999958 | 7.885 |  |  |
| 2.069999999999958 | 7.925 |  |  |
| 2.074999999999958 | 7.965 |  |  |
| 2.079999999999957 | 8.004 |  |  |
| 2.084999999999957 | 8.045 |  |  |
| 2.089999999999957 | 8.085 |  |  |
| 2.094999999999957 | 8.125 |  |  |
| 2.099999999999957 | 8.166 |  |  |
| 2.104999999999957 | 8.207 |  |  |
| 2.109999999999957 | 8.248 |  |  |
| 2.114999999999957 | 8.29 |  |  |
| 2.119999999999957 | 8.331 |  |  |
| 2.124999999999956 | 8.373 |  |  |
| 2.129999999999956 | 8.415 |  |  |
| 2.134999999999956 | 8.457 |  |  |
| 2.139999999999956 | 8.499 |  |  |
| 2.144999999999956 | 8.542 |  |  |
| 2.149999999999956 | 8.585 |  |  |
| 2.154999999999956 | 8.628 |  |  |
| 2.159999999999956 | 8.671 |  |  |
| 2.164999999999956 | 8.715 |  |  |
| 2.169999999999955 | 8.758 |  |  |
| 2.174999999999955 | 8.802 |  |  |
| 2.179999999999955 | 8.846 |  |  |
| 2.184999999999955 | 8.891 |  |  |
| 2.189999999999955 | 8.935 |  |  |
| 2.194999999999955 | 8.98 |  |  |
| 2.199999999999955 | 9.025 |  |  |
| 2.204999999999955 | 9.07 |  |  |
| 2.209999999999955 | 9.116 |  |  |
| 2.214999999999955 | 9.161 |  |  |
| 2.219999999999954 | 9.207 |  |  |
| 2.224999999999954 | 9.253 |  |  |
| 2.229999999999954 | 9.3 |  |  |
| 2.234999999999954 | 9.346 |  |  |
| 2.239999999999954 | 9.393 |  |  |
| 2.244999999999954 | 9.44 |  |  |
| 2.249999999999954 | 9.488 |  |  |
| 2.254999999999954 | 9.535 |  |  |
| 2.259999999999954 | 9.583 |  |  |
| 2.264999999999953 | 9.631 |  |  |
| 2.269999999999953 | 9.679 |  |  |
| 2.274999999999953 | 9.728 |  |  |
| 2.279999999999953 | 9.777 |  |  |
| 2.284999999999953 | 9.826 |  |  |
| 2.289999999999953 | 9.875 |  |  |
| 2.294999999999953 | 9.924 |  |  |
| 2.299999999999953 | 9.974 |  |  |
| 2.304999999999953 | 10.024 |  |  |
| 2.309999999999952 | 10.074 |  |  |
| 2.314999999999952 | 10.125 |  |  |
| 2.319999999999952 | 10.176 |  |  |
| 2.324999999999952 | 10.227 |  |  |
| 2.329999999999952 | 10.278 |  |  |
| 2.334999999999952 | 10.329 |  |  |
| 2.339999999999952 | 10.381 |  |  |
| 2.344999999999952 | 10.433 |  |  |
| 2.349999999999952 | 10.486 |  |  |
| 2.354999999999952 | 10.538 |  |  |
| 2.359999999999951 | 10.591 |  |  |
| 2.364999999999951 | 10.644 |  |  |
| 2.369999999999951 | 10.697 |  |  |
| 2.374999999999951 | 10.751 |  |  |
| 2.379999999999951 | 10.805 |  |  |
| 2.384999999999951 | 10.859 |  |  |
| 2.389999999999951 | 10.913 |  |  |
| 2.394999999999951 | 10.968 |  |  |
| 2.399999999999951 | 11.023 |  |  |
| 2.40499999999995 | 11.078 |  |  |
| 2.40999999999995 | 11.134 |  |  |
| 2.41499999999995 | 11.19 |  |  |
| 2.41999999999995 | 11.246 |  |  |
| 2.42499999999995 | 11.302 |  |  |
| 2.42999999999995 | 11.359 |  |  |
| 2.43499999999995 | 11.416 |  |  |
| 2.43999999999995 | 11.473 |  |  |
| 2.44499999999995 | 11.531 |  |  |
| 2.44999999999995 | 11.588 |  |  |
| 2.454999999999949 | 11.646 |  |  |
| 2.459999999999949 | 11.705 |  |  |
| 2.464999999999949 | 11.763 |  |  |
| 2.469999999999949 | 11.822 |  |  |
| 2.474999999999949 | 11.882 |  |  |
| 2.479999999999949 | 11.941 |  |  |
| 2.484999999999949 | 12.001 |  |  |
| 2.489999999999949 | 12.061 |  |  |
| 2.494999999999949 | 12.122 |  |  |
| 2.499999999999948 | 12.182 |  |  |
| 2.504999999999948 | 12.244 |  |  |
| 2.509999999999948 | 12.305 |  |  |
| 2.514999999999948 | 12.367 |  |  |
| 2.519999999999948 | 12.429 |  |  |
| 2.524999999999948 | 12.491 |  |  |
| 2.529999999999948 | 12.554 |  |  |
| 2.534999999999948 | 12.616 |  |  |
| 2.539999999999948 | 12.68 |  |  |
| 2.544999999999948 | 12.743 |  |  |
| 2.549999999999947 | 12.807 |  |  |
| 2.554999999999947 | 12.871 |  |  |
| 2.559999999999947 | 12.936 |  |  |
| 2.564999999999947 | 13.001 |  |  |
| 2.569999999999947 | 13.066 |  |  |
| 2.574999999999947 | 13.131 |  |  |
| 2.579999999999947 | 13.197 |  |  |
| 2.584999999999947 | 13.263 |  |  |
| 2.589999999999947 | 13.33 |  |  |
| 2.594999999999946 | 13.397 |  |  |
| 2.599999999999946 | 13.464 |  |  |
| 2.604999999999946 | 13.531 |  |  |
| 2.609999999999946 | 13.599 |  |  |
| 2.614999999999946 | 13.667 |  |  |
| 2.619999999999946 | 13.736 |  |  |
| 2.624999999999946 | 13.805 |  |  |
| 2.629999999999946 | 13.874 |  |  |
| 2.634999999999946 | 13.943 |  |  |
| 2.639999999999945 | 14.013 |  |  |
| 2.644999999999945 | 14.083 |  |  |
| 2.649999999999945 | 14.154 |  |  |
| 2.654999999999945 | 14.225 |  |  |
| 2.659999999999945 | 14.296 |  |  |
| 2.664999999999945 | 14.368 |  |  |
| 2.669999999999945 | 14.44 |  |  |
| 2.674999999999945 | 14.512 |  |  |
| 2.679999999999945 | 14.585 |  |  |
| 2.684999999999944 | 14.658 |  |  |
| 2.689999999999944 | 14.732 |  |  |
| 2.694999999999944 | 14.806 |  |  |
| 2.699999999999944 | 14.88 |  |  |
| 2.704999999999944 | 14.954 |  |  |
| 2.709999999999944 | 15.029 |  |  |
| 2.714999999999944 | 15.105 |  |  |
| 2.719999999999944 | 15.18 |  |  |
| 2.724999999999944 | 15.256 |  |  |
| 2.729999999999944 | 15.333 |  |  |
| 2.734999999999943 | 15.41 |  |  |
| 2.739999999999943 | 15.487 |  |  |
| 2.744999999999943 | 15.565 |  |  |
| 2.749999999999943 | 15.643 |  |  |
| 2.754999999999943 | 15.721 |  |  |
| 2.759999999999943 | 15.8 |  |  |
| 2.764999999999943 | 15.879 |  |  |
| 2.769999999999943 | 15.959 |  |  |
| 2.774999999999943 | 16.039 |  |  |
| 2.779999999999942 | 16.119 |  |  |
| 2.784999999999942 | 16.2 |  |  |
| 2.789999999999942 | 16.281 |  |  |
| 2.794999999999942 | 16.363 |  |  |
| 2.799999999999942 | 16.445 |  |  |
| 2.804999999999942 | 16.527 |  |  |
| 2.809999999999942 | 16.61 |  |  |
| 2.814999999999942 | 16.693 |  |  |
| 2.819999999999942 | 16.777 |  |  |
| 2.824999999999942 | 16.861 |  |  |
| 2.829999999999941 | 16.945 |  |  |
| 2.834999999999941 | 17.03 |  |  |
| 2.839999999999941 | 17.116 |  |  |
| 2.844999999999941 | 17.202 |  |  |
| 2.849999999999941 | 17.288 |  |  |
| 2.854999999999941 | 17.374 |  |  |
| 2.859999999999941 | 17.462 |  |  |
| 2.864999999999941 | 17.549 |  |  |
| 2.869999999999941 | 17.637 |  |  |
| 2.87499999999994 | 17.725 |  |  |
| 2.87999999999994 | 17.814 |  |  |
| 2.88499999999994 | 17.904 |  |  |
| 2.88999999999994 | 17.993 |  |  |
| 2.89499999999994 | 18.084 |  |  |
| 2.89999999999994 | 18.174 |  |  |
| 2.90499999999994 | 18.265 |  |  |
| 2.90999999999994 | 18.357 |  |  |
| 2.91499999999994 | 18.449 |  |  |
| 2.91999999999994 | 18.541 |  |  |
| 2.924999999999939 | 18.634 |  |  |
| 2.929999999999939 | 18.728 |  |  |
| 2.934999999999939 | 18.822 |  |  |
| 2.939999999999939 | 18.916 |  |  |
| 2.944999999999939 | 19.011 |  |  |
| 2.949999999999939 | 19.106 |  |  |
| 2.954999999999939 | 19.202 |  |  |
| 2.959999999999939 | 19.298 |  |  |
| 2.964999999999939 | 19.395 |  |  |
| 2.969999999999938 | 19.492 |  |  |
| 2.974999999999938 | 19.59 |  |  |
| 2.979999999999938 | 19.688 |  |  |
| 2.984999999999938 | 19.787 |  |  |
| 2.989999999999938 | 19.886 |  |  |
| 2.994999999999938 | 19.985 |  |  |
| 2.999999999999938 | 20.086 |  |  |
| 3.004999999999938 | 20.186 |  |  |
| 3.009999999999938 | 20.287 |  |  |
| 3.014999999999938 | 20.389 |  |  |
| 3.019999999999937 | 20.491 |  |  |
| 3.024999999999937 | 20.594 |  |  |
| 3.029999999999937 | 20.697 |  |  |
| 3.034999999999937 | 20.801 |  |  |
| 3.039999999999937 | 20.905 |  |  |
| 3.044999999999937 | 21.01 |  |  |
| 3.049999999999937 | 21.115 |  |  |
| 3.054999999999937 | 21.221 |  |  |
| 3.059999999999937 | 21.328 |  |  |
| 3.064999999999936 | 21.434 |  |  |
| 3.069999999999936 | 21.542 |  |  |
| 3.074999999999936 | 21.65 |  |  |
| 3.079999999999936 | 21.758 |  |  |
| 3.084999999999936 | 21.867 |  |  |
| 3.089999999999936 | 21.977 |  |  |
| 3.094999999999936 | 22.087 |  |  |
| 3.099999999999936 | 22.198 |  |  |
| 3.104999999999936 | 22.309 |  |  |
| 3.109999999999935 | 22.421 |  |  |
| 3.114999999999935 | 22.533 |  |  |
| 3.119999999999935 | 22.646 |  |  |
| 3.124999999999935 | 22.76 |  |  |
| 3.129999999999935 | 22.874 |  |  |
| 3.134999999999935 | 22.989 |  |  |
| 3.139999999999935 | 23.104 |  |  |
| 3.144999999999935 | 23.22 |  |  |
| 3.149999999999935 | 23.336 |  |  |
| 3.154999999999935 | 23.453 |  |  |
| 3.159999999999934 | 23.571 |  |  |
| 3.164999999999934 | 23.689 |  |  |
| 3.169999999999934 | 23.807 |  |  |
| 3.174999999999934 | 23.927 |  |  |
| 3.179999999999934 | 24.047 |  |  |
| 3.184999999999934 | 24.167 |  |  |
| 3.189999999999934 | 24.288 |  |  |
| 3.194999999999934 | 24.41 |  |  |
| 3.199999999999934 | 24.533 |  |  |
| 3.204999999999933 | 24.656 |  |  |
| 3.209999999999933 | 24.779 |  |  |
| 3.214999999999933 | 24.903 |  |  |
| 3.219999999999933 | 25.028 |  |  |
| 3.224999999999933 | 25.154 |  |  |
| 3.229999999999933 | 25.28 |  |  |
| 3.234999999999933 | 25.406 |  |  |
| 3.239999999999933 | 25.534 |  |  |
| 3.244999999999932 | 25.662 |  |  |
| 3.249999999999932 | 25.79 |  |  |
| 3.254999999999932 | 25.92 |  |  |
| 3.259999999999932 | 26.05 |  |  |
| 3.264999999999932 | 26.18 |  |  |
| 3.269999999999932 | 26.311 |  |  |
| 3.274999999999932 | 26.443 |  |  |
| 3.279999999999932 | 26.576 |  |  |
| 3.284999999999932 | 26.709 |  |  |
| 3.289999999999932 | 26.843 |  |  |
| 3.294999999999932 | 26.977 |  |  |
| 3.299999999999931 | 27.113 |  |  |
| 3.304999999999931 | 27.249 |  |  |
| 3.309999999999931 | 27.385 |  |  |
| 3.314999999999931 | 27.522 |  |  |
| 3.319999999999931 | 27.66 |  |  |
| 3.324999999999931 | 27.799 |  |  |
| 3.329999999999931 | 27.938 |  |  |
| 3.334999999999931 | 28.078 |  |  |
| 3.339999999999931 | 28.219 |  |  |
| 3.34499999999993 | 28.361 |  |  |
| 3.34999999999993 | 28.503 |  |  |
| 3.35499999999993 | 28.646 |  |  |
| 3.35999999999993 | 28.789 |  |  |
| 3.36499999999993 | 28.933 |  |  |
| 3.36999999999993 | 29.079 |  |  |
| 3.37499999999993 | 29.224 |  |  |
| 3.37999999999993 | 29.371 |  |  |
| 3.38499999999993 | 29.518 |  |  |
| 3.389999999999929 | 29.666 |  |  |
| 3.394999999999929 | 29.815 |  |  |
| 3.399999999999929 | 29.964 |  |  |
| 3.404999999999929 | 30.114 |  |  |
| 3.409999999999929 | 30.265 |  |  |
| 3.414999999999929 | 30.417 |  |  |
| 3.419999999999929 | 30.569 |  |  |
| 3.424999999999929 | 30.723 |  |  |
| 3.429999999999929 | 30.877 |  |  |
| 3.434999999999929 | 31.031 |  |  |
| 3.439999999999928 | 31.187 |  |  |
| 3.444999999999928 | 31.343 |  |  |
| 3.449999999999928 | 31.5 |  |  |
| 3.454999999999928 | 31.658 |  |  |
| 3.459999999999928 | 31.817 |  |  |
| 3.464999999999928 | 31.976 |  |  |
| 3.469999999999928 | 32.137 |  |  |
| 3.474999999999928 | 32.298 |  |  |
| 3.479999999999928 | 32.46 |  |  |
| 3.484999999999927 | 32.622 |  |  |
| 3.489999999999927 | 32.786 |  |  |
| 3.494999999999927 | 32.95 |  |  |
| 3.499999999999927 | 33.115 |  |  |
| 3.504999999999927 | 33.281 |  |  |
| 3.509999999999927 | 33.448 |  |  |
| 3.514999999999927 | 33.616 |  |  |
| 3.519999999999927 | 33.784 |  |  |
| 3.524999999999927 | 33.954 |  |  |
| 3.529999999999927 | 34.124 |  |  |
| 3.534999999999926 | 34.295 |  |  |
| 3.539999999999926 | 34.467 |  |  |
| 3.544999999999926 | 34.64 |  |  |
| 3.549999999999926 | 34.813 |  |  |
| 3.554999999999926 | 34.988 |  |  |
| 3.559999999999926 | 35.163 |  |  |
| 3.564999999999926 | 35.339 |  |  |
| 3.569999999999926 | 35.517 |  |  |
| 3.574999999999926 | 35.695 |  |  |
| 3.579999999999925 | 35.874 |  |  |
| 3.584999999999925 | 36.053 |  |  |
| 3.589999999999925 | 36.234 |  |  |
| 3.594999999999925 | 36.416 |  |  |
| 3.599999999999925 | 36.598 |  |  |
| 3.604999999999925 | 36.782 |  |  |
| 3.609999999999925 | 36.966 |  |  |
| 3.614999999999925 | 37.151 |  |  |
| 3.619999999999925 | 37.338 |  |  |
| 3.624999999999924 | 37.525 |  |  |
| 3.629999999999924 | 37.713 |  |  |
| 3.634999999999924 | 37.902 |  |  |
| 3.639999999999924 | 38.092 |  |  |
| 3.644999999999924 | 38.283 |  |  |
| 3.649999999999924 | 38.475 |  |  |
| 3.654999999999924 | 38.668 |  |  |
| 3.659999999999924 | 38.861 |  |  |
| 3.664999999999924 | 39.056 |  |  |
| 3.669999999999923 | 39.252 |  |  |
| 3.674999999999923 | 39.449 |  |  |
| 3.679999999999923 | 39.646 |  |  |
| 3.684999999999923 | 39.845 |  |  |
| 3.689999999999923 | 40.045 |  |  |
| 3.694999999999923 | 40.246 |  |  |
| 3.699999999999923 | 40.447 |  |  |
| 3.704999999999923 | 40.65 |  |  |
| 3.709999999999923 | 40.854 |  |  |
| 3.714999999999923 | 41.059 |  |  |
| 3.719999999999922 | 41.264 |  |  |
| 3.724999999999922 | 41.471 |  |  |
| 3.729999999999922 | 41.679 |  |  |
| 3.734999999999922 | 41.888 |  |  |
| 3.739999999999922 | 42.098 |  |  |
| 3.744999999999922 | 42.309 |  |  |
| 3.749999999999922 | 42.521 |  |  |
| 3.754999999999922 | 42.734 |  |  |
| 3.759999999999922 | 42.948 |  |  |
| 3.764999999999921 | 43.164 |  |  |
| 3.769999999999921 | 43.38 |  |  |
| 3.774999999999921 | 43.598 |  |  |
| 3.779999999999921 | 43.816 |  |  |
| 3.784999999999921 | 44.036 |  |  |
| 3.789999999999921 | 44.256 |  |  |
| 3.794999999999921 | 44.478 |  |  |
| 3.799999999999921 | 44.701 |  |  |
| 3.804999999999921 | 44.925 |  |  |
| 3.809999999999921 | 45.15 |  |  |
| 3.81499999999992 | 45.377 |  |  |
| 3.81999999999992 | 45.604 |  |  |
| 3.82499999999992 | 45.833 |  |  |
| 3.82999999999992 | 46.063 |  |  |
| 3.83499999999992 | 46.293 |  |  |
| 3.83999999999992 | 46.525 |  |  |
| 3.84499999999992 | 46.759 |  |  |
| 3.84999999999992 | 46.993 |  |  |
| 3.85499999999992 | 47.229 |  |  |
| 3.859999999999919 | 47.465 |  |  |
| 3.864999999999919 | 47.703 |  |  |
| 3.869999999999919 | 47.942 |  |  |
| 3.874999999999919 | 48.183 |  |  |
| 3.879999999999919 | 48.424 |  |  |
| 3.884999999999919 | 48.667 |  |  |
| 3.889999999999919 | 48.911 |  |  |
| 3.894999999999919 | 49.156 |  |  |
| 3.899999999999919 | 49.402 |  |  |
| 3.904999999999919 | 49.65 |  |  |
| 3.909999999999918 | 49.899 |  |  |
| 3.914999999999918 | 50.149 |  |  |
| 3.919999999999918 | 50.4 |  |  |
| 3.924999999999918 | 50.653 |  |  |
| 3.929999999999918 | 50.907 |  |  |
| 3.934999999999918 | 51.162 |  |  |
| 3.939999999999918 | 51.419 |  |  |
| 3.944999999999918 | 51.676 |  |  |
| 3.949999999999918 | 51.935 |  |  |
| 3.954999999999917 | 52.196 |  |  |
| 3.959999999999917 | 52.457 |  |  |
| 3.964999999999917 | 52.72 |  |  |
| 3.969999999999917 | 52.985 |  |  |
| 3.974999999999917 | 53.25 |  |  |
| 3.979999999999917 | 53.517 |  |  |
| 3.984999999999917 | 53.785 |  |  |
| 3.989999999999917 | 54.055 |  |  |
| 3.994999999999917 | 54.326 |  |  |
| 3.999999999999916 | 54.598 |  |  |
| 4.004999999999916 | 54.872 |  |  |
| 4.009999999999916 | 55.147 |  |  |
| 4.014999999999916 | 55.423 |  |  |
| 4.019999999999916 | 55.701 |  |  |
| 4.024999999999916 | 55.98 |  |  |
| 4.029999999999916 | 56.261 |  |  |
| 4.034999999999916 | 56.543 |  |  |
| 4.039999999999915 | 56.826 |  |  |
| 4.044999999999916 | 57.111 |  |  |
| 4.049999999999915 | 57.397 |  |  |
| 4.054999999999915 | 57.685 |  |  |
| 4.059999999999915 | 57.974 |  |  |
| 4.064999999999915 | 58.265 |  |  |
| 4.069999999999915 | 58.557 |  |  |
| 4.074999999999915 | 58.85 |  |  |
| 4.079999999999914 | 59.145 |  |  |
| 4.084999999999915 | 59.442 |  |  |
| 4.089999999999914 | 59.74 |  |  |
| 4.094999999999914 | 60.039 |  |  |
| 4.099999999999914 | 60.34 |  |  |
| 4.104999999999914 | 60.643 |  |  |
| 4.109999999999914 | 60.947 |  |  |
| 4.114999999999914 | 61.252 |  |  |
| 4.119999999999914 | 61.559 |  |  |
| 4.124999999999914 | 61.868 |  |  |
| 4.129999999999914 | 62.178 |  |  |
| 4.134999999999914 | 62.49 |  |  |
| 4.139999999999914 | 62.803 |  |  |
| 4.144999999999913 | 63.118 |  |  |
| 4.149999999999913 | 63.434 |  |  |
| 4.154999999999913 | 63.752 |  |  |
| 4.159999999999913 | 64.072 |  |  |
| 4.164999999999913 | 64.393 |  |  |
| 4.169999999999913 | 64.715 |  |  |
| 4.174999999999913 | 65.04 |  |  |
| 4.179999999999913 | 65.366 |  |  |
| 4.184999999999913 | 65.694 |  |  |
| 4.189999999999912 | 66.023 |  |  |
| 4.194999999999912 | 66.354 |  |  |
| 4.199999999999912 | 66.686 |  |  |
| 4.204999999999912 | 67.021 |  |  |
| 4.209999999999912 | 67.357 |  |  |
| 4.214999999999912 | 67.694 |  |  |
| 4.219999999999912 | 68.033 |  |  |
| 4.224999999999912 | 68.375 |  |  |
| 4.229999999999912 | 68.717 |  |  |
| 4.234999999999911 | 69.062 |  |  |
| 4.239999999999911 | 69.408 |  |  |
| 4.244999999999911 | 69.756 |  |  |
| 4.249999999999911 | 70.105 |  |  |
| 4.254999999999911 | 70.457 |  |  |
| 4.259999999999911 | 70.81 |  |  |
| 4.264999999999911 | 71.165 |  |  |
| 4.269999999999911 | 71.522 |  |  |
| 4.274999999999911 | 71.88 |  |  |
| 4.27999999999991 | 72.24 |  |  |
| 4.28499999999991 | 72.603 |  |  |
| 4.28999999999991 | 72.966 |  |  |
| 4.29499999999991 | 73.332 |  |  |
| 4.29999999999991 | 73.7 |  |  |
| 4.30499999999991 | 74.069 |  |  |
| 4.30999999999991 | 74.44 |  |  |
| 4.31499999999991 | 74.814 |  |  |
| 4.31999999999991 | 75.189 |  |  |
| 4.32499999999991 | 75.566 |  |  |
| 4.329999999999909 | 75.944 |  |  |
| 4.334999999999909 | 76.325 |  |  |
| 4.33999999999991 | 76.708 |  |  |
| 4.344999999999909 | 77.092 |  |  |
| 4.349999999999909 | 77.478 |  |  |
| 4.354999999999909 | 77.867 |  |  |
| 4.359999999999909 | 78.257 |  |  |
| 4.364999999999909 | 78.649 |  |  |
| 4.369999999999909 | 79.044 |  |  |
| 4.374999999999908 | 79.44 |  |  |
| 4.379999999999908 | 79.838 |  |  |
| 4.384999999999908 | 80.238 |  |  |
| 4.389999999999908 | 80.64 |  |  |
| 4.394999999999908 | 81.045 |  |  |
| 4.399999999999908 | 81.451 |  |  |
| 4.404999999999908 | 81.859 |  |  |
| 4.409999999999907 | 82.269 |  |  |
| 4.414999999999908 | 82.682 |  |  |
| 4.419999999999907 | 83.096 |  |  |
| 4.424999999999907 | 83.513 |  |  |
| 4.429999999999907 | 83.931 |  |  |
| 4.434999999999907 | 84.352 |  |  |
| 4.439999999999907 | 84.775 |  |  |
| 4.444999999999907 | 85.2 |  |  |
| 4.449999999999906 | 85.627 |  |  |
| 4.454999999999907 | 86.056 |  |  |
| 4.459999999999906 | 86.488 |  |  |
| 4.464999999999907 | 86.921 |  |  |
| 4.469999999999906 | 87.357 |  |  |
| 4.474999999999906 | 87.795 |  |  |
| 4.479999999999906 | 88.235 |  |  |
| 4.484999999999906 | 88.677 |  |  |
| 4.489999999999906 | 89.121 |  |  |
| 4.494999999999906 | 89.568 |  |  |
| 4.499999999999905 | 90.017 |  |  |
| 4.504999999999906 | 90.468 |  |  |
| 4.509999999999905 | 90.922 |  |  |
| 4.514999999999906 | 91.378 |  |  |
| 4.519999999999905 | 91.836 |  |  |
| 4.524999999999905 | 92.296 |  |  |
| 4.529999999999905 | 92.759 |  |  |
| 4.534999999999905 | 93.224 |  |  |
| 4.539999999999904 | 93.691 |  |  |
| 4.544999999999905 | 94.16 |  |  |
| 4.549999999999904 | 94.632 |  |  |
| 4.554999999999905 | 95.107 |  |  |
| 4.559999999999904 | 95.583 |  |  |
| 4.564999999999904 | 96.063 |  |  |
| 4.569999999999904 | 96.544 |  |  |
| 4.574999999999904 | 97.028 |  |  |
| 4.579999999999904 | 97.514 |  |  |
| 4.584999999999904 | 98.003 |  |  |
| 4.589999999999904 | 98.494 |  |  |
| 4.594999999999904 | 98.988 |  |  |
| 4.599999999999904 | 99.484 |  |  |
| 4.604999999999904 | 99.983 |  |  |
| 4.609999999999903 | 100.484 |  |  |
| 4.614999999999903 | 100.988 |  |  |
| 4.619999999999903 | 101.494 |  |  |
| 4.624999999999903 | 102.003 |  |  |
| 4.629999999999903 | 102.514 |  |  |
| 4.634999999999903 | 103.028 |  |  |
| 4.639999999999903 | 103.544 |  |  |
| 4.644999999999903 | 104.063 |  |  |
| 4.649999999999903 | 104.585 |  |  |
| 4.654999999999902 | 105.109 |  |  |
| 4.659999999999902 | 105.636 |  |  |
| 4.664999999999902 | 106.166 |  |  |
| 4.669999999999902 | 106.698 |  |  |
| 4.674999999999902 | 107.233 |  |  |
| 4.679999999999902 | 107.77 |  |  |
| 4.684999999999902 | 108.31 |  |  |
| 4.689999999999902 | 108.853 |  |  |
| 4.694999999999902 | 109.399 |  |  |
| 4.699999999999901 | 109.947 |  |  |
| 4.704999999999901 | 110.498 |  |  |
| 4.709999999999901 | 111.052 |  |  |
| 4.714999999999901 | 111.609 |  |  |
| 4.719999999999901 | 112.168 |  |  |
| 4.724999999999901 | 112.73 |  |  |
| 4.729999999999901 | 113.296 |  |  |
| 4.734999999999901 | 113.863 |  |  |
| 4.7399999999999 | 114.434 |  |  |
| 4.744999999999901 | 115.008 |  |  |
| 4.7499999999999 | 115.584 |  |  |
| 4.7549999999999 | 116.164 |  |  |
| 4.7599999999999 | 116.746 |  |  |
| 4.7649999999999 | 117.331 |  |  |
| 4.7699999999999 | 117.919 |  |  |
| 4.7749999999999 | 118.51 |  |  |
| 4.7799999999999 | 119.104 |  |  |
| 4.7849999999999 | 119.701 |  |  |
| 4.7899999999999 | 120.301 |  |  |
| 4.794999999999899 | 120.904 |  |  |
| 4.7999999999999 | 121.51 |  |  |
| 4.804999999999899 | 122.119 |  |  |
| 4.8099999999999 | 122.732 |  |  |
| 4.814999999999899 | 123.347 |  |  |
| 4.819999999999899 | 123.965 |  |  |
| 4.824999999999899 | 124.586 |  |  |
| 4.829999999999899 | 125.211 |  |  |
| 4.834999999999899 | 125.839 |  |  |
| 4.839999999999898 | 126.469 |  |  |
| 4.844999999999898 | 127.103 |  |  |
| 4.849999999999898 | 127.74 |  |  |
| 4.854999999999898 | 128.381 |  |  |
| 4.859999999999898 | 129.024 |  |  |
| 4.864999999999898 | 129.671 |  |  |
| 4.869999999999898 | 130.321 |  |  |
| 4.874999999999898 | 130.974 |  |  |
| 4.879999999999897 | 131.631 |  |  |
| 4.884999999999898 | 132.29 |  |  |
| 4.889999999999897 | 132.954 |  |  |
| 4.894999999999897 | 133.62 |  |  |
| 4.899999999999897 | 134.29 |  |  |
| 4.904999999999897 | 134.963 |  |  |
| 4.909999999999897 | 135.639 |  |  |
| 4.914999999999897 | 136.319 |  |  |
| 4.919999999999896 | 137.003 |  |  |
| 4.924999999999897 | 137.689 |  |  |
| 4.929999999999896 | 138.38 |  |  |
| 4.934999999999896 | 139.073 |  |  |
| 4.939999999999896 | 139.77 |  |  |
| 4.944999999999896 | 140.471 |  |  |
| 4.949999999999896 | 141.175 |  |  |
| 4.954999999999896 | 141.883 |  |  |
| 4.959999999999896 | 142.594 |  |  |
| 4.964999999999896 | 143.309 |  |  |
| 4.969999999999895 | 144.027 |  |  |
| 4.974999999999895 | 144.749 |  |  |
| 4.979999999999895 | 145.474 |  |  |
| 4.984999999999895 | 146.204 |  |  |
| 4.989999999999895 | 146.936 |  |  |
| 4.994999999999895 | 147.673 |  |  |
| 4.999999999999895 | 148.413 |  |  |
| 5.004999999999895 | 149.157 |  |  |
| 5.009999999999894 | 149.905 |  |  |
| 5.014999999999895 | 150.656 |  |  |
| 5.019999999999894 | 151.411 |  |  |
| 5.024999999999895 | 152.17 |  |  |
| 5.029999999999894 | 152.933 |  |  |
| 5.034999999999894 | 153.7 |  |  |
| 5.039999999999894 | 154.47 |  |  |
| 5.044999999999894 | 155.244 |  |  |
| 5.049999999999894 | 156.022 |  |  |
| 5.054999999999894 | 156.805 |  |  |
| 5.059999999999894 | 157.591 |  |  |
| 5.064999999999894 | 158.38 |  |  |
| 5.069999999999894 | 159.174 |  |  |
| 5.074999999999894 | 159.972 |  |  |
| 5.079999999999893 | 160.774 |  |  |
| 5.084999999999893 | 161.58 |  |  |
| 5.089999999999893 | 162.39 |  |  |
| 5.094999999999893 | 163.204 |  |  |
| 5.099999999999893 | 164.022 |  |  |
| 5.104999999999893 | 164.844 |  |  |
| 5.109999999999893 | 165.67 |  |  |
| 5.114999999999893 | 166.501 |  |  |
| 5.119999999999893 | 167.335 |  |  |
| 5.124999999999893 | 168.174 |  |  |
| 5.129999999999892 | 169.017 |  |  |
| 5.134999999999892 | 169.864 |  |  |
| 5.139999999999892 | 170.716 |  |  |
| 5.144999999999892 | 171.571 |  |  |
| 5.149999999999892 | 172.431 |  |  |
| 5.154999999999892 | 173.296 |  |  |
| 5.159999999999892 | 174.164 |  |  |
| 5.164999999999892 | 175.037 |  |  |
| 5.169999999999892 | 175.915 |  |  |
| 5.174999999999891 | 176.797 |  |  |
| 5.179999999999891 | 177.683 |  |  |
| 5.184999999999891 | 178.573 |  |  |
| 5.189999999999891 | 179.469 |  |  |
| 5.194999999999891 | 180.368 |  |  |
| 5.199999999999891 | 181.272 |  |  |
| 5.204999999999891 | 182.181 |  |  |
| 5.20999999999989 | 183.094 |  |  |
| 5.214999999999891 | 184.012 |  |  |
| 5.21999999999989 | 184.934 |  |  |
| 5.22499999999989 | 185.861 |  |  |
| 5.22999999999989 | 186.793 |  |  |
| 5.23499999999989 | 187.729 |  |  |
| 5.23999999999989 | 188.67 |  |  |
| 5.24499999999989 | 189.616 |  |  |
| 5.24999999999989 | 190.566 |  |  |
| 5.25499999999989 | 191.521 |  |  |
| 5.25999999999989 | 192.481 |  |  |
| 5.26499999999989 | 193.446 |  |  |
| 5.26999999999989 | 194.416 |  |  |
| 5.27499999999989 | 195.39 |  |  |
| 5.27999999999989 | 196.37 |  |  |
| 5.28499999999989 | 197.354 |  |  |
| 5.289999999999888 | 198.343 |  |  |
| 5.294999999999889 | 199.338 |  |  |
| 5.299999999999888 | 200.337 |  |  |
| 5.304999999999889 | 201.341 |  |  |
| 5.309999999999888 | 202.35 |  |  |
| 5.314999999999888 | 203.365 |  |  |
| 5.319999999999888 | 204.384 |  |  |
| 5.324999999999888 | 205.408 |  |  |
| 5.329999999999888 | 206.438 |  |  |
| 5.334999999999888 | 207.473 |  |  |
| 5.339999999999887 | 208.513 |  |  |
| 5.344999999999888 | 209.558 |  |  |
| 5.349999999999887 | 210.608 |  |  |
| 5.354999999999888 | 211.664 |  |  |
| 5.359999999999887 | 212.725 |  |  |
| 5.364999999999887 | 213.791 |  |  |
| 5.369999999999887 | 214.863 |  |  |
| 5.374999999999887 | 215.94 |  |  |
| 5.379999999999887 | 217.022 |  |  |
| 5.384999999999887 | 218.11 |  |  |
| 5.389999999999886 | 219.203 |  |  |
| 5.394999999999887 | 220.302 |  |  |
| 5.399999999999886 | 221.406 |  |  |
| 5.404999999999886 | 222.516 |  |  |
| 5.409999999999886 | 223.632 |  |  |
| 5.414999999999886 | 224.753 |  |  |
| 5.419999999999886 | 225.879 |  |  |
| 5.424999999999886 | 227.011 |  |  |
| 5.429999999999885 | 228.149 |  |  |
| 5.434999999999885 | 229.293 |  |  |
| 5.439999999999885 | 230.442 |  |  |
| 5.444999999999885 | 231.597 |  |  |
| 5.449999999999885 | 232.758 |  |  |
| 5.454999999999885 | 233.925 |  |  |
| 5.459999999999885 | 235.097 |  |  |
| 5.464999999999885 | 236.276 |  |  |
| 5.469999999999885 | 237.46 |  |  |
| 5.474999999999885 | 238.65 |  |  |
| 5.479999999999884 | 239.847 |  |  |
| 5.484999999999884 | 241.049 |  |  |
| 5.489999999999884 | 242.257 |  |  |
| 5.494999999999884 | 243.472 |  |  |
| 5.499999999999884 | 244.692 |  |  |
| 5.504999999999884 | 245.918 |  |  |
| 5.509999999999884 | 247.151 |  |  |
| 5.514999999999884 | 248.39 |  |  |
| 5.519999999999884 | 249.635 |  |  |
| 5.524999999999884 | 250.886 |  |  |
| 5.529999999999884 | 252.144 |  |  |
| 5.534999999999884 | 253.408 |  |  |
| 5.539999999999883 | 254.678 |  |  |
| 5.544999999999884 | 255.955 |  |  |
| 5.549999999999883 | 257.238 |  |  |
| 5.554999999999883 | 258.527 |  |  |
| 5.559999999999883 | 259.823 |  |  |
| 5.564999999999883 | 261.125 |  |  |
| 5.569999999999883 | 262.434 |  |  |
| 5.574999999999883 | 263.75 |  |  |
| 5.579999999999882 | 265.072 |  |  |
| 5.584999999999883 | 266.4 |  |  |
| 5.589999999999882 | 267.736 |  |  |
| 5.594999999999882 | 269.078 |  |  |
| 5.599999999999882 | 270.426 |  |  |
| 5.604999999999882 | 271.782 |  |  |
| 5.609999999999882 | 273.144 |  |  |
| 5.614999999999882 | 274.513 |  |  |
| 5.619999999999882 | 275.889 |  |  |
| 5.624999999999882 | 277.272 |  |  |
| 5.629999999999882 | 278.662 |  |  |
| 5.634999999999882 | 280.059 |  |  |
| 5.639999999999881 | 281.463 |  |  |
| 5.644999999999881 | 282.874 |  |  |
| 5.649999999999881 | 284.291 |  |  |
| 5.654999999999881 | 285.716 |  |  |
| 5.659999999999881 | 287.149 |  |  |
| 5.664999999999881 | 288.588 |  |  |
| 5.669999999999881 | 290.035 |  |  |
| 5.674999999999881 | 291.488 |  |  |
| 5.67999999999988 | 292.949 |  |  |
| 5.68499999999988 | 294.418 |  |  |
| 5.68999999999988 | 295.894 |  |  |
| 5.69499999999988 | 297.377 |  |  |
| 5.69999999999988 | 298.867 |  |  |
| 5.70499999999988 | 300.365 |  |  |
| 5.70999999999988 | 301.871 |  |  |
| 5.71499999999988 | 303.384 |  |  |
| 5.71999999999988 | 304.905 |  |  |
| 5.72499999999988 | 306.433 |  |  |
| 5.72999999999988 | 307.969 |  |  |
| 5.73499999999988 | 309.513 |  |  |
| 5.73999999999988 | 311.064 |  |  |
| 5.74499999999988 | 312.624 |  |  |
| 5.74999999999988 | 314.191 |  |  |
| 5.75499999999988 | 315.766 |  |  |
| 5.759999999999878 | 317.348 |  |  |
| 5.764999999999879 | 318.939 |  |  |
| 5.769999999999878 | 320.538 |  |  |
| 5.774999999999878 | 322.144 |  |  |
| 5.779999999999878 | 323.759 |  |  |
| 5.784999999999878 | 325.382 |  |  |
| 5.789999999999878 | 327.013 |  |  |
| 5.794999999999878 | 328.652 |  |  |
| 5.799999999999878 | 330.3 |  |  |
| 5.804999999999878 | 331.955 |  |  |
| 5.809999999999877 | 333.619 |  |  |
| 5.814999999999878 | 335.291 |  |  |
| 5.819999999999877 | 336.972 |  |  |
| 5.824999999999878 | 338.661 |  |  |
| 5.829999999999877 | 340.359 |  |  |
| 5.834999999999877 | 342.065 |  |  |
| 5.839999999999877 | 343.779 |  |  |
| 5.844999999999877 | 345.503 |  |  |
| 5.849999999999877 | 347.234 |  |  |
| 5.854999999999877 | 348.975 |  |  |
| 5.859999999999876 | 350.724 |  |  |
| 5.864999999999877 | 352.482 |  |  |
| 5.869999999999876 | 354.249 |  |  |
| 5.874999999999876 | 356.025 |  |  |
| 5.879999999999876 | 357.809 |  |  |
| 5.884999999999876 | 359.603 |  |  |
| 5.889999999999876 | 361.405 |  |  |
| 5.894999999999876 | 363.217 |  |  |
| 5.899999999999875 | 365.037 |  |  |
| 5.904999999999875 | 366.867 |  |  |
| 5.909999999999875 | 368.706 |  |  |
| 5.914999999999875 | 370.554 |  |  |
| 5.919999999999875 | 372.412 |  |  |
| 5.924999999999875 | 374.278 |  |  |
| 5.929999999999875 | 376.155 |  |  |
| 5.934999999999875 | 378.04 |  |  |
| 5.939999999999875 | 379.935 |  |  |
| 5.944999999999875 | 381.839 |  |  |
| 5.949999999999874 | 383.753 |  |  |
| 5.954999999999874 | 385.677 |  |  |
| 5.959999999999874 | 387.61 |  |  |
| 5.964999999999874 | 389.553 |  |  |
| 5.969999999999874 | 391.506 |  |  |
| 5.974999999999874 | 393.468 |  |  |
| 5.979999999999874 | 395.44 |  |  |
| 5.984999999999874 | 397.423 |  |  |
| 5.989999999999874 | 399.415 |  |  |
| 5.994999999999874 | 401.417 |  |  |
| 5.999999999999873 | 403.429 |  |  |
| 6.004999999999874 | 405.451 |  |  |
| 6.009999999999873 | 407.483 |  |  |
| 6.014999999999874 | 409.526 |  |  |
| 6.019999999999873 | 411.579 |  |  |
| 6.024999999999873 | 413.642 |  |  |
| 6.029999999999873 | 415.715 |  |  |
| 6.034999999999873 | 417.799 |  |  |
| 6.039999999999873 | 419.893 |  |  |
| 6.044999999999873 | 421.998 |  |  |
| 6.049999999999872 | 424.113 |  |  |
| 6.054999999999873 | 426.239 |  |  |
| 6.059999999999872 | 428.375 |  |  |
| 6.064999999999872 | 430.523 |  |  |
| 6.069999999999872 | 432.681 |  |  |
| 6.074999999999872 | 434.85 |  |  |
| 6.079999999999872 | 437.029 |  |  |
| 6.084999999999872 | 439.22 |  |  |
| 6.089999999999871 | 441.421 |  |  |
| 6.094999999999872 | 443.634 |  |  |
| 6.099999999999871 | 445.858 |  |  |
| 6.104999999999872 | 448.093 |  |  |
| 6.109999999999871 | 450.339 |  |  |
| 6.114999999999871 | 452.596 |  |  |
| 6.119999999999871 | 454.865 |  |  |
| 6.124999999999871 | 457.145 |  |  |
| 6.129999999999871 | 459.436 |  |  |
| 6.134999999999871 | 461.739 |  |  |
| 6.13999999999987 | 464.054 |  |  |
| 6.144999999999871 | 466.38 |  |  |
| 6.14999999999987 | 468.717 |  |  |
| 6.154999999999871 | 471.067 |  |  |
| 6.15999999999987 | 473.428 |  |  |
| 6.16499999999987 | 475.801 |  |  |
| 6.16999999999987 | 478.186 |  |  |
| 6.17499999999987 | 480.583 |  |  |
| 6.17999999999987 | 482.992 |  |  |
| 6.18499999999987 | 485.413 |  |  |
| 6.18999999999987 | 487.846 |  |  |
| 6.19499999999987 | 490.291 |  |  |
| 6.19999999999987 | 492.749 |  |  |
| 6.20499999999987 | 495.219 |  |  |
| 6.20999999999987 | 497.701 |  |  |
| 6.21499999999987 | 500.196 |  |  |
| 6.21999999999987 | 502.703 |  |  |
| 6.22499999999987 | 505.223 |  |  |
| 6.229999999999868 | 507.755 |  |  |
| 6.234999999999868 | 510.301 |  |  |
| 6.239999999999868 | 512.859 |  |  |
| 6.244999999999868 | 515.429 |  |  |
| 6.249999999999868 | 518.013 |  |  |
| 6.254999999999868 | 520.609 |  |  |
| 6.259999999999868 | 523.219 |  |  |
| 6.264999999999868 | 525.842 |  |  |
| 6.269999999999868 | 528.477 |  |  |
| 6.274999999999867 | 531.126 |  |  |
| 6.279999999999867 | 533.789 |  |  |
| 6.284999999999867 | 536.464 |  |  |
| 6.289999999999867 | 539.153 |  |  |
| 6.294999999999867 | 541.856 |  |  |
| 6.299999999999867 | 544.572 |  |  |
| 6.304999999999867 | 547.302 |  |  |
| 6.309999999999867 | 550.045 |  |  |
| 6.314999999999867 | 552.802 |  |  |
| 6.319999999999867 | 555.573 |  |  |
| 6.324999999999867 | 558.358 |  |  |
| 6.329999999999866 | 561.157 |  |  |
| 6.334999999999866 | 563.969 |  |  |
| 6.339999999999866 | 566.796 |  |  |
| 6.344999999999866 | 569.637 |  |  |
| 6.349999999999866 | 572.493 |  |  |
| 6.354999999999866 | 575.362 |  |  |
| 6.359999999999866 | 578.246 |  |  |
| 6.364999999999866 | 581.145 |  |  |
| 6.369999999999865 | 584.058 |  |  |
| 6.374999999999865 | 586.985 |  |  |
| 6.379999999999865 | 589.928 |  |  |
| 6.384999999999865 | 592.885 |  |  |
| 6.389999999999865 | 595.857 |  |  |
| 6.394999999999865 | 598.843 |  |  |
| 6.399999999999865 | 601.845 |  |  |
| 6.404999999999865 | 604.862 |  |  |
| 6.409999999999865 | 607.894 |  |  |
| 6.414999999999865 | 610.941 |  |  |
| 6.419999999999864 | 614.003 |  |  |
| 6.424999999999864 | 617.081 |  |  |
| 6.429999999999864 | 620.174 |  |  |
| 6.434999999999864 | 623.283 |  |  |
| 6.439999999999864 | 626.407 |  |  |
| 6.444999999999864 | 629.547 |  |  |
| 6.449999999999864 | 632.702 |  |  |
| 6.454999999999864 | 635.874 |  |  |
| 6.459999999999864 | 639.061 |  |  |
| 6.464999999999864 | 642.264 |  |  |
| 6.469999999999863 | 645.484 |  |  |
| 6.474999999999863 | 648.719 |  |  |
| 6.479999999999863 | 651.971 |  |  |
| 6.484999999999863 | 655.239 |  |  |
| 6.489999999999863 | 658.523 |  |  |
| 6.494999999999863 | 661.824 |  |  |
| 6.499999999999863 | 665.142 |  |  |
| 6.504999999999863 | 668.476 |  |  |
| 6.509999999999863 | 671.826 |  |  |
| 6.514999999999863 | 675.194 |  |  |
| 6.519999999999862 | 678.578 |  |  |
| 6.524999999999863 | 681.98 |  |  |
| 6.529999999999862 | 685.398 |  |  |
| 6.534999999999862 | 688.834 |  |  |
| 6.539999999999862 | 692.287 |  |  |
| 6.544999999999862 | 695.757 |  |  |
| 6.549999999999862 | 699.244 |  |  |
| 6.554999999999862 | 702.749 |  |  |
| 6.559999999999861 | 706.272 |  |  |
| 6.564999999999862 | 709.812 |  |  |
| 6.569999999999861 | 713.37 |  |  |
| 6.574999999999861 | 716.946 |  |  |
| 6.57999999999986 | 720.539 |  |  |
| 6.584999999999861 | 724.151 |  |  |
| 6.58999999999986 | 727.781 |  |  |
| 6.594999999999861 | 731.429 |  |  |
| 6.59999999999986 | 735.095 |  |  |
| 6.604999999999861 | 738.78 |  |  |
| 6.60999999999986 | 742.483 |  |  |
| 6.614999999999861 | 746.205 |  |  |
| 6.61999999999986 | 749.945 |  |  |
| 6.62499999999986 | 753.704 |  |  |
| 6.62999999999986 | 757.482 |  |  |
| 6.63499999999986 | 761.279 |  |  |
| 6.63999999999986 | 765.095 |  |  |
| 6.64499999999986 | 768.93 |  |  |
| 6.64999999999986 | 772.784 |  |  |
| 6.65499999999986 | 776.658 |  |  |
| 6.65999999999986 | 780.551 |  |  |
| 6.66499999999986 | 784.463 |  |  |
| 6.669999999999859 | 788.396 |  |  |
| 6.674999999999859 | 792.347 |  |  |
| 6.67999999999986 | 796.319 |  |  |
| 6.684999999999859 | 800.311 |  |  |
| 6.68999999999986 | 804.322 |  |  |
| 6.694999999999859 | 808.354 |  |  |
| 6.699999999999859 | 812.406 |  |  |
| 6.704999999999859 | 816.478 |  |  |
| 6.709999999999858 | 820.571 |  |  |
| 6.714999999999859 | 824.684 |  |  |
| 6.719999999999858 | 828.818 |  |  |
| 6.724999999999858 | 832.972 |  |  |
| 6.729999999999858 | 837.147 |  |  |
| 6.734999999999858 | 841.343 |  |  |
| 6.739999999999858 | 845.561 |  |  |
| 6.744999999999858 | 849.799 |  |  |
| 6.749999999999857 | 854.059 |  |  |
| 6.754999999999858 | 858.34 |  |  |
| 6.759999999999857 | 862.642 |  |  |
| 6.764999999999857 | 866.966 |  |  |
| 6.769999999999857 | 871.312 |  |  |
| 6.774999999999857 | 875.679 |  |  |
| 6.779999999999857 | 880.069 |  |  |
| 6.784999999999857 | 884.48 |  |  |
| 6.789999999999856 | 888.914 |  |  |
| 6.794999999999857 | 893.369 |  |  |
| 6.799999999999856 | 897.847 |  |  |
| 6.804999999999857 | 902.348 |  |  |
| 6.809999999999856 | 906.871 |  |  |
| 6.814999999999856 | 911.417 |  |  |
| 6.819999999999856 | 915.985 |  |  |
| 6.824999999999856 | 920.576 |  |  |
| 6.829999999999856 | 925.191 |  |  |
| 6.834999999999856 | 929.828 |  |  |
| 6.839999999999855 | 934.489 |  |  |
| 6.844999999999856 | 939.173 |  |  |
| 6.849999999999855 | 943.881 |  |  |
| 6.854999999999856 | 948.612 |  |  |
| 6.859999999999855 | 953.367 |  |  |
| 6.864999999999855 | 958.146 |  |  |
| 6.869999999999855 | 962.949 |  |  |
| 6.874999999999855 | 967.775 |  |  |
| 6.879999999999855 | 972.626 |  |  |
| 6.884999999999855 | 977.502 |  |  |
| 6.889999999999854 | 982.401 |  |  |
| 6.894999999999855 | 987.326 |  |  |
| 6.899999999999854 | 992.275 |  |  |
| 6.904999999999854 | 997.249 |  |  |
| 6.909999999999854 | 1002.247 |  |  |
| 6.914999999999854 | 1007.271 |  |  |
| 6.919999999999854 | 1012.32 |  |  |
| 6.924999999999854 | 1017.394 |  |  |
| 6.929999999999854 | 1022.494 |  |  |
| 6.934999999999854 | 1027.619 |  |  |
| 6.939999999999853 | 1032.77 |  |  |
| 6.944999999999854 | 1037.947 |  |  |
| 6.949999999999853 | 1043.15 |  |  |
| 6.954999999999853 | 1048.379 |  |  |
| 6.959999999999853 | 1053.634 |  |  |
| 6.964999999999853 | 1058.915 |  |  |
| 6.969999999999853 | 1064.223 |  |  |
| 6.974999999999853 | 1069.557 |  |  |
| 6.979999999999852 | 1074.918 |  |  |
| 6.984999999999853 | 1080.306 |  |  |
| 6.989999999999852 | 1085.721 |  |  |
| 6.994999999999853 | 1091.164 |  |  |
| 6.999999999999852 | 1096.633 |  |  |
| 7.004999999999852 | 1102.13 |  |  |
| 7.009999999999852 | 1107.655 |  |  |
| 7.014999999999852 | 1113.207 |  |  |
| 7.019999999999852 | 1118.787 |  |  |
| 7.024999999999852 | 1124.395 |  |  |
| 7.029999999999852 | 1130.031 |  |  |
| 7.034999999999852 | 1135.695 |  |  |
| 7.039999999999851 | 1141.388 |  |  |
| 7.044999999999852 | 1147.109 |  |  |
| 7.049999999999851 | 1152.859 |  |  |
| 7.054999999999851 | 1158.637 |  |  |
| 7.059999999999851 | 1164.445 |  |  |
| 7.064999999999851 | 1170.282 |  |  |
| 7.069999999999851 | 1176.148 |  |  |
| 7.074999999999851 | 1182.044 |  |  |
| 7.07999999999985 | 1187.969 |  |  |
| 7.084999999999851 | 1193.923 |  |  |
| 7.08999999999985 | 1199.908 |  |  |
| 7.094999999999851 | 1205.922 |  |  |
| 7.09999999999985 | 1211.967 |  |  |
| 7.10499999999985 | 1218.042 |  |  |
| 7.10999999999985 | 1224.148 |  |  |
| 7.11499999999985 | 1230.284 |  |  |
| 7.11999999999985 | 1236.45 |  |  |
| 7.12499999999985 | 1242.648 |  |  |
| 7.12999999999985 | 1248.877 |  |  |
| 7.13499999999985 | 1255.137 |  |  |
| 7.13999999999985 | 1261.428 |  |  |
| 7.144999999999849 | 1267.751 |  |  |
| 7.14999999999985 | 1274.106 |  |  |
| 7.154999999999849 | 1280.492 |  |  |
| 7.15999999999985 | 1286.911 |  |  |
| 7.164999999999849 | 1293.362 |  |  |
| 7.169999999999849 | 1299.845 |  |  |
| 7.174999999999849 | 1306.36 |  |  |
| 7.179999999999848 | 1312.908 |  |  |
| 7.184999999999849 | 1319.489 |  |  |
| 7.189999999999848 | 1326.103 |  |  |
| 7.194999999999848 | 1332.75 |  |  |
| 7.199999999999848 | 1339.431 |  |  |
| 7.204999999999848 | 1346.145 |  |  |
| 7.209999999999848 | 1352.892 |  |  |
| 7.214999999999848 | 1359.674 |  |  |
| 7.219999999999847 | 1366.489 |  |  |
| 7.224999999999848 | 1373.339 |  |  |
| 7.229999999999847 | 1380.223 |  |  |
| 7.234999999999847 | 1387.141 |  |  |
| 7.239999999999847 | 1394.094 |  |  |
| 7.244999999999847 | 1401.082 |  |  |
| 7.249999999999847 | 1408.105 |  |  |
| 7.254999999999847 | 1415.163 |  |  |
| 7.259999999999846 | 1422.257 |  |  |
| 7.264999999999847 | 1429.386 |  |  |
| 7.269999999999846 | 1436.55 |  |  |
| 7.274999999999846 | 1443.751 |  |  |
| 7.279999999999846 | 1450.988 |  |  |
| 7.284999999999846 | 1458.261 |  |  |
| 7.289999999999846 | 1465.571 |  |  |
| 7.294999999999846 | 1472.917 |  |  |
| 7.299999999999846 | 1480.3 |  |  |
| 7.304999999999846 | 1487.72 |  |  |
| 7.309999999999845 | 1495.177 |  |  |
| 7.314999999999846 | 1502.672 |  |  |
| 7.319999999999845 | 1510.204 |  |  |
| 7.324999999999846 | 1517.774 |  |  |
| 7.329999999999845 | 1525.382 |  |  |
| 7.334999999999845 | 1533.028 |  |  |
| 7.339999999999845 | 1540.712 |  |  |
| 7.344999999999845 | 1548.435 |  |  |
| 7.349999999999845 | 1556.197 |  |  |
| 7.354999999999845 | 1563.997 |  |  |
| 7.359999999999844 | 1571.837 |  |  |
| 7.364999999999845 | 1579.715 |  |  |
| 7.369999999999844 | 1587.634 |  |  |
| 7.374999999999844 | 1595.592 |  |  |
| 7.379999999999844 | 1603.59 |  |  |
| 7.384999999999844 | 1611.628 |  |  |
| 7.389999999999844 | 1619.706 |  |  |
| 7.394999999999844 | 1627.825 |  |  |
| 7.399999999999844 | 1635.984 |  |  |
| 7.404999999999844 | 1644.185 |  |  |
| 7.409999999999843 | 1652.426 |  |  |
| 7.414999999999844 | 1660.709 |  |  |
| 7.419999999999843 | 1669.034 |  |  |
| 7.424999999999843 | 1677.4 |  |  |
| 7.429999999999843 | 1685.808 |  |  |
| 7.434999999999843 | 1694.258 |  |  |
| 7.439999999999843 | 1702.75 |  |  |
| 7.444999999999843 | 1711.285 |  |  |
| 7.449999999999842 | 1719.863 |  |  |
| 7.454999999999843 | 1728.484 |  |  |
| 7.459999999999842 | 1737.148 |  |  |
| 7.464999999999843 | 1745.856 |  |  |
| 7.469999999999842 | 1754.607 |  |  |
| 7.474999999999842 | 1763.402 |  |  |
| 7.479999999999842 | 1772.241 |  |  |
| 7.484999999999842 | 1781.124 |  |  |
| 7.489999999999842 | 1790.052 |  |  |
| 7.494999999999842 | 1799.025 |  |  |
| 7.499999999999841 | 1808.042 |  |  |
| 7.504999999999842 | 1817.105 |  |  |
| 7.509999999999841 | 1826.214 |  |  |
| 7.514999999999842 | 1835.367 |  |  |
| 7.519999999999841 | 1844.567 |  |  |
| 7.524999999999841 | 1853.813 |  |  |
| 7.529999999999841 | 1863.106 |  |  |
| 7.534999999999841 | 1872.444 |  |  |
| 7.53999999999984 | 1881.83 |  |  |
| 7.544999999999841 | 1891.263 |  |  |
| 7.54999999999984 | 1900.743 |  |  |
| 7.554999999999841 | 1910.27 |  |  |
| 7.55999999999984 | 1919.846 |  |  |
| 7.564999999999841 | 1929.469 |  |  |
| 7.56999999999984 | 1939.14 |  |  |
| 7.57499999999984 | 1948.86 |  |  |
| 7.57999999999984 | 1958.629 |  |  |
| 7.58499999999984 | 1968.447 |  |  |
| 7.58999999999984 | 1978.314 |  |  |
| 7.59499999999984 | 1988.23 |  |  |
| 7.59999999999984 | 1998.196 |  |  |
| 7.60499999999984 | 2008.212 |  |  |
| 7.60999999999984 | 2018.278 |  |  |
| 7.614999999999839 | 2028.395 |  |  |
| 7.61999999999984 | 2038.562 |  |  |
| 7.624999999999839 | 2048.78 |  |  |
| 7.62999999999984 | 2059.05 |  |  |
| 7.634999999999839 | 2069.371 |  |  |
| 7.639999999999838 | 2079.744 |  |  |
| 7.644999999999839 | 2090.169 |  |  |
| 7.649999999999838 | 2100.646 |  |  |
| 7.654999999999839 | 2111.175 |  |  |
| 7.659999999999838 | 2121.757 |  |  |
| 7.664999999999838 | 2132.393 |  |  |
| 7.669999999999838 | 2143.081 |  |  |
| 7.674999999999838 | 2153.824 |  |  |
| 7.679999999999837 | 2164.62 |  |  |
| 7.684999999999838 | 2175.47 |  |  |
| 7.689999999999837 | 2186.375 |  |  |
| 7.694999999999838 | 2197.334 |  |  |
| 7.699999999999837 | 2208.348 |  |  |
| 7.704999999999837 | 2219.417 |  |  |
| 7.709999999999837 | 2230.542 |  |  |
| 7.714999999999837 | 2241.723 |  |  |
| 7.719999999999837 | 2252.96 |  |  |
| 7.724999999999837 | 2264.253 |  |  |
| 7.729999999999836 | 2275.602 |  |  |
| 7.734999999999836 | 2287.009 |  |  |
| 7.739999999999836 | 2298.472 |  |  |
| 7.744999999999836 | 2309.994 |  |  |
| 7.749999999999836 | 2321.572 |  |  |
| 7.754999999999836 | 2333.209 |  |  |
| 7.759999999999836 | 2344.905 |  |  |
| 7.764999999999836 | 2356.658 |  |  |
| 7.769999999999836 | 2368.471 |  |  |
| 7.774999999999835 | 2380.343 |  |  |
| 7.779999999999835 | 2392.275 |  |  |
| 7.784999999999835 | 2404.266 |  |  |
| 7.789999999999835 | 2416.318 |  |  |
| 7.794999999999835 | 2428.429 |  |  |
| 7.799999999999835 | 2440.602 |  |  |
| 7.804999999999835 | 2452.836 |  |  |
| 7.809999999999835 | 2465.13 |  |  |
| 7.814999999999835 | 2477.487 |  |  |
| 7.819999999999835 | 2489.905 |  |  |
| 7.824999999999835 | 2502.386 |  |  |
| 7.829999999999834 | 2514.929 |  |  |
| 7.834999999999834 | 2527.536 |  |  |
| 7.839999999999834 | 2540.205 |  |  |
| 7.844999999999834 | 2552.938 |  |  |
| 7.849999999999834 | 2565.734 |  |  |
| 7.854999999999834 | 2578.595 |  |  |
| 7.859999999999834 | 2591.52 |  |  |
| 7.864999999999834 | 2604.51 |  |  |
| 7.869999999999834 | 2617.566 |  |  |
| 7.874999999999834 | 2630.686 |  |  |
| 7.879999999999833 | 2643.873 |  |  |
| 7.884999999999834 | 2657.125 |  |  |
| 7.889999999999833 | 2670.444 |  |  |
| 7.894999999999833 | 2683.83 |  |  |
| 7.899999999999833 | 2697.282 |  |  |
| 7.904999999999833 | 2710.803 |  |  |
| 7.909999999999833 | 2724.39 |  |  |
| 7.914999999999833 | 2738.047 |  |  |
| 7.919999999999832 | 2751.771 |  |  |
| 7.924999999999833 | 2765.564 |  |  |
| 7.929999999999832 | 2779.427 |  |  |
| 7.934999999999832 | 2793.359 |  |  |
| 7.939999999999832 | 2807.361 |  |  |
| 7.944999999999832 | 2821.432 |  |  |
| 7.949999999999832 | 2835.575 |  |  |
| 7.954999999999832 | 2849.788 |  |  |
| 7.959999999999832 | 2864.073 |  |  |
| 7.964999999999832 | 2878.429 |  |  |
| 7.969999999999831 | 2892.857 |  |  |
| 7.974999999999831 | 2907.358 |  |  |
| 7.97999999999983 | 2921.931 |  |  |
| 7.984999999999831 | 2936.577 |  |  |
| 7.98999999999983 | 2951.297 |  |  |
| 7.994999999999831 | 2966.09 |  |  |
| 7.99999999999983 | 2980.958 |  |  |